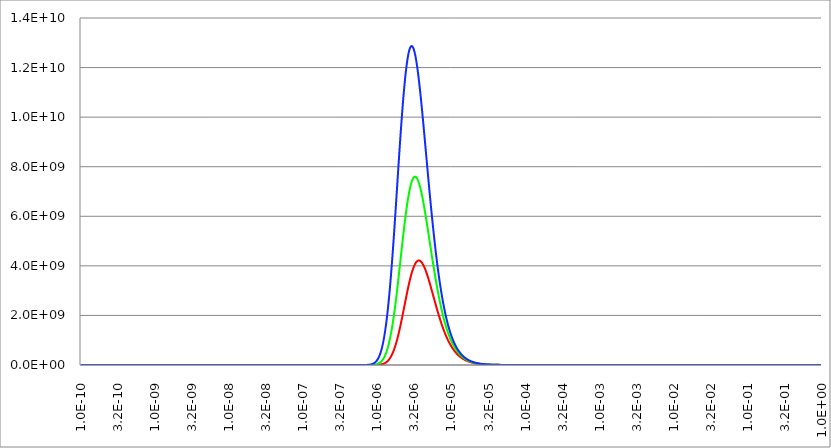
| Category | Series 1 | Series 0 | Series 2 |
|---|---|---|---|
| 1e-10 | 0 | 0 | 0 |
| 1.0115794542599e-10 | 0 | 0 | 0 |
| 1.02329299228075e-10 | 0 | 0 | 0 |
| 1.03514216667934e-10 | 0 | 0 | 0 |
| 1.0471285480509e-10 | 0 | 0 | 0 |
| 1.05925372517729e-10 | 0 | 0 | 0 |
| 1.07151930523761e-10 | 0 | 0 | 0 |
| 1.0839269140212e-10 | 0 | 0 | 0 |
| 1.09647819614319e-10 | 0 | 0 | 0 |
| 1.1091748152624e-10 | 0 | 0 | 0 |
| 1.12201845430196e-10 | 0 | 0 | 0 |
| 1.13501081567232e-10 | 0 | 0 | 0 |
| 1.14815362149688e-10 | 0 | 0 | 0 |
| 1.16144861384034e-10 | 0 | 0 | 0 |
| 1.17489755493953e-10 | 0 | 0 | 0 |
| 1.18850222743702e-10 | 0 | 0 | 0 |
| 1.20226443461741e-10 | 0 | 0 | 0 |
| 1.21618600064637e-10 | 0 | 0 | 0 |
| 1.23026877081238e-10 | 0 | 0 | 0 |
| 1.24451461177139e-10 | 0 | 0 | 0 |
| 1.25892541179417e-10 | 0 | 0 | 0 |
| 1.27350308101666e-10 | 0 | 0 | 0 |
| 1.28824955169314e-10 | 0 | 0 | 0 |
| 1.3031667784523e-10 | 0 | 0 | 0 |
| 1.31825673855641e-10 | 0 | 0 | 0 |
| 1.33352143216333e-10 | 0 | 0 | 0 |
| 1.34896288259166e-10 | 0 | 0 | 0 |
| 1.36458313658893e-10 | 0 | 0 | 0 |
| 1.38038426460289e-10 | 0 | 0 | 0 |
| 1.39636836105594e-10 | 0 | 0 | 0 |
| 1.41253754462276e-10 | 0 | 0 | 0 |
| 1.42889395851111e-10 | 0 | 0 | 0 |
| 1.44543977074593e-10 | 0 | 0 | 0 |
| 1.46217717445672e-10 | 0 | 0 | 0 |
| 1.47910838816821e-10 | 0 | 0 | 0 |
| 1.49623565609444e-10 | 0 | 0 | 0 |
| 1.51356124843621e-10 | 0 | 0 | 0 |
| 1.53108746168203e-10 | 0 | 0 | 0 |
| 1.54881661891248e-10 | 0 | 0 | 0 |
| 1.56675107010815e-10 | 0 | 0 | 0 |
| 1.58489319246112e-10 | 0 | 0 | 0 |
| 1.60324539069005e-10 | 0 | 0 | 0 |
| 1.62181009735893e-10 | 0 | 0 | 0 |
| 1.64058977319954e-10 | 0 | 0 | 0 |
| 1.65958690743756e-10 | 0 | 0 | 0 |
| 1.67880401812256e-10 | 0 | 0 | 0 |
| 1.69824365246175e-10 | 0 | 0 | 0 |
| 1.71790838715759e-10 | 0 | 0 | 0 |
| 1.73780082874938e-10 | 0 | 0 | 0 |
| 1.7579236139587e-10 | 0 | 0 | 0 |
| 1.77827941003893e-10 | 0 | 0 | 0 |
| 1.79887091512879e-10 | 0 | 0 | 0 |
| 1.81970085860999e-10 | 0 | 0 | 0 |
| 1.84077200146896e-10 | 0 | 0 | 0 |
| 1.86208713666287e-10 | 0 | 0 | 0 |
| 1.88364908948981e-10 | 0 | 0 | 0 |
| 1.90546071796325e-10 | 0 | 0 | 0 |
| 1.92752491319094e-10 | 0 | 0 | 0 |
| 1.94984459975805e-10 | 0 | 0 | 0 |
| 1.97242273611486e-10 | 0 | 0 | 0 |
| 1.99526231496889e-10 | 0 | 0 | 0 |
| 2.01836636368157e-10 | 0 | 0 | 0 |
| 2.04173794466954e-10 | 0 | 0 | 0 |
| 2.06538015581054e-10 | 0 | 0 | 0 |
| 2.08929613085405e-10 | 0 | 0 | 0 |
| 2.11348903983666e-10 | 0 | 0 | 0 |
| 2.13796208950224e-10 | 0 | 0 | 0 |
| 2.16271852372703e-10 | 0 | 0 | 0 |
| 2.18776162394956e-10 | 0 | 0 | 0 |
| 2.21309470960565e-10 | 0 | 0 | 0 |
| 2.23872113856835e-10 | 0 | 0 | 0 |
| 2.26464430759307e-10 | 0 | 0 | 0 |
| 2.29086765276778e-10 | 0 | 0 | 0 |
| 2.31739464996849e-10 | 0 | 0 | 0 |
| 2.34422881531993e-10 | 0 | 0 | 0 |
| 2.37137370566167e-10 | 0 | 0 | 0 |
| 2.3988329190195e-10 | 0 | 0 | 0 |
| 2.42661009508243e-10 | 0 | 0 | 0 |
| 2.45470891568504e-10 | 0 | 0 | 0 |
| 2.48313310529558e-10 | 0 | 0 | 0 |
| 2.51188643150959e-10 | 0 | 0 | 0 |
| 2.54097270554932e-10 | 0 | 0 | 0 |
| 2.57039578276888e-10 | 0 | 0 | 0 |
| 2.60015956316529e-10 | 0 | 0 | 0 |
| 2.6302679918954e-10 | 0 | 0 | 0 |
| 2.66072505979882e-10 | 0 | 0 | 0 |
| 2.69153480392693e-10 | 0 | 0 | 0 |
| 2.72270130807793e-10 | 0 | 0 | 0 |
| 2.75422870333818e-10 | 0 | 0 | 0 |
| 2.78612116862979e-10 | 0 | 0 | 0 |
| 2.81838293126447e-10 | 0 | 0 | 0 |
| 2.85101826750393e-10 | 0 | 0 | 0 |
| 2.88403150312662e-10 | 0 | 0 | 0 |
| 2.91742701400118e-10 | 0 | 0 | 0 |
| 2.9512092266664e-10 | 0 | 0 | 0 |
| 2.98538261891798e-10 | 0 | 0 | 0 |
| 3.01995172040203e-10 | 0 | 0 | 0 |
| 3.05492111321553e-10 | 0 | 0 | 0 |
| 3.09029543251361e-10 | 0 | 0 | 0 |
| 3.12607936712397e-10 | 0 | 0 | 0 |
| 3.1622776601684e-10 | 0 | 0 | 0 |
| 3.19889510969142e-10 | 0 | 0 | 0 |
| 3.2359365692963e-10 | 0 | 0 | 0 |
| 3.2734069487884e-10 | 0 | 0 | 0 |
| 3.31131121482593e-10 | 0 | 0 | 0 |
| 3.3496543915783e-10 | 0 | 0 | 0 |
| 3.38844156139205e-10 | 0 | 0 | 0 |
| 3.42767786546453e-10 | 0 | 0 | 0 |
| 3.46736850452534e-10 | 0 | 0 | 0 |
| 3.5075187395257e-10 | 0 | 0 | 0 |
| 3.54813389233578e-10 | 0 | 0 | 0 |
| 3.58921934645008e-10 | 0 | 0 | 0 |
| 3.63078054770104e-10 | 0 | 0 | 0 |
| 3.67282300498087e-10 | 0 | 0 | 0 |
| 3.71535229097175e-10 | 0 | 0 | 0 |
| 3.75837404288447e-10 | 0 | 0 | 0 |
| 3.80189396320564e-10 | 0 | 0 | 0 |
| 3.84591782045356e-10 | 0 | 0 | 0 |
| 3.89045144994284e-10 | 0 | 0 | 0 |
| 3.9355007545578e-10 | 0 | 0 | 0 |
| 3.981071705535e-10 | 0 | 0 | 0 |
| 4.02717034325462e-10 | 0 | 0 | 0 |
| 4.07380277804116e-10 | 0 | 0 | 0 |
| 4.12097519097333e-10 | 0 | 0 | 0 |
| 4.16869383470339e-10 | 0 | 0 | 0 |
| 4.21696503428586e-10 | 0 | 0 | 0 |
| 4.26579518801596e-10 | 0 | 0 | 0 |
| 4.31519076827769e-10 | 0 | 0 | 0 |
| 4.36515832240169e-10 | 0 | 0 | 0 |
| 4.41570447353316e-10 | 0 | 0 | 0 |
| 4.46683592150967e-10 | 0 | 0 | 0 |
| 4.51855944374926e-10 | 0 | 0 | 0 |
| 4.57088189614879e-10 | 0 | 0 | 0 |
| 4.62381021399264e-10 | 0 | 0 | 0 |
| 4.67735141287202e-10 | 0 | 0 | 0 |
| 4.73151258961485e-10 | 0 | 0 | 0 |
| 4.78630092322642e-10 | 0 | 0 | 0 |
| 4.84172367584104e-10 | 0 | 0 | 0 |
| 4.89778819368451e-10 | 0 | 0 | 0 |
| 4.95450190804795e-10 | 0 | 0 | 0 |
| 5.01187233627277e-10 | 0 | 0 | 0 |
| 5.06990708274709e-10 | 0 | 0 | 0 |
| 5.12861383991369e-10 | 0 | 0 | 0 |
| 5.18800038928966e-10 | 0 | 0 | 0 |
| 5.24807460249777e-10 | 0 | 0 | 0 |
| 5.30884444230993e-10 | 0 | 0 | 0 |
| 5.37031796370258e-10 | 0 | 0 | 0 |
| 5.43250331492438e-10 | 0 | 0 | 0 |
| 5.4954087385763e-10 | 0 | 0 | 0 |
| 5.55904257270409e-10 | 0 | 0 | 0 |
| 5.62341325190354e-10 | 0 | 0 | 0 |
| 5.68852930843847e-10 | 0 | 0 | 0 |
| 5.75439937337162e-10 | 0 | 0 | 0 |
| 5.82103217770877e-10 | 0 | 0 | 0 |
| 5.88843655355595e-10 | 0 | 0 | 0 |
| 5.95662143529016e-10 | 0 | 0 | 0 |
| 6.02559586074364e-10 | 0 | 0 | 0 |
| 6.09536897240175e-10 | 0 | 0 | 0 |
| 6.16595001861488e-10 | 0 | 0 | 0 |
| 6.23734835482425e-10 | 0 | 0 | 0 |
| 6.309573444802e-10 | 0 | 0 | 0 |
| 6.38263486190555e-10 | 0 | 0 | 0 |
| 6.45654229034662e-10 | 0 | 0 | 0 |
| 6.53130552647479e-10 | 0 | 0 | 0 |
| 6.60693448007603e-10 | 0 | 0 | 0 |
| 6.68343917568622e-10 | 0 | 0 | 0 |
| 6.76082975391989e-10 | 0 | 0 | 0 |
| 6.83911647281436e-10 | 0 | 0 | 0 |
| 6.91830970918944e-10 | 0 | 0 | 0 |
| 6.99841996002281e-10 | 0 | 0 | 0 |
| 7.07945784384146e-10 | 0 | 0 | 0 |
| 7.1614341021291e-10 | 0 | 0 | 0 |
| 7.24435960074998e-10 | 0 | 0 | 0 |
| 7.32824533138912e-10 | 0 | 0 | 0 |
| 7.41310241300926e-10 | 0 | 0 | 0 |
| 7.49894209332464e-10 | 0 | 0 | 0 |
| 7.58577575029192e-10 | 0 | 0 | 0 |
| 7.67361489361827e-10 | 0 | 0 | 0 |
| 7.762471166287e-10 | 0 | 0 | 0 |
| 7.85235634610081e-10 | 0 | 0 | 0 |
| 7.9432823472429e-10 | 0 | 0 | 0 |
| 8.03526122185626e-10 | 0 | 0 | 0 |
| 8.12830516164109e-10 | 0 | 0 | 0 |
| 8.2224264994708e-10 | 0 | 0 | 0 |
| 8.31763771102681e-10 | 0 | 0 | 0 |
| 8.41395141645205e-10 | 0 | 0 | 0 |
| 8.51138038202386e-10 | 0 | 0 | 0 |
| 8.60993752184611e-10 | 0 | 0 | 0 |
| 8.70963589956091e-10 | 0 | 0 | 0 |
| 8.81048873008025e-10 | 0 | 0 | 0 |
| 8.91250938133756e-10 | 0 | 0 | 0 |
| 9.01571137605968e-10 | 0 | 0 | 0 |
| 9.12010839355921e-10 | 0 | 0 | 0 |
| 9.22571427154774e-10 | 0 | 0 | 0 |
| 9.33254300797002e-10 | 0 | 0 | 0 |
| 9.44060876285935e-10 | 0 | 0 | 0 |
| 9.54992586021448e-10 | 0 | 0 | 0 |
| 9.66050878989825e-10 | 0 | 0 | 0 |
| 9.77237220955822e-10 | 0 | 0 | 0 |
| 9.88553094656951e-10 | 0 | 0 | 0 |
| 1.00000000000001e-09 | 0 | 0 | 0 |
| 1.01157945425991e-09 | 0 | 0 | 0 |
| 1.02329299228077e-09 | 0 | 0 | 0 |
| 1.03514216667936e-09 | 0 | 0 | 0 |
| 1.04712854805091e-09 | 0 | 0 | 0 |
| 1.0592537251773e-09 | 0 | 0 | 0 |
| 1.07151930523762e-09 | 0 | 0 | 0 |
| 1.08392691402122e-09 | 0 | 0 | 0 |
| 1.0964781961432e-09 | 0 | 0 | 0 |
| 1.10917481526242e-09 | 0 | 0 | 0 |
| 1.12201845430198e-09 | 0 | 0 | 0 |
| 1.13501081567233e-09 | 0 | 0 | 0 |
| 1.1481536214969e-09 | 0 | 0 | 0 |
| 1.16144861384036e-09 | 0 | 0 | 0 |
| 1.17489755493954e-09 | 0 | 0 | 0 |
| 1.18850222743703e-09 | 0 | 0 | 0 |
| 1.20226443461743e-09 | 0 | 0 | 0 |
| 1.21618600064638e-09 | 0 | 0 | 0 |
| 1.2302687708124e-09 | 0 | 0 | 0 |
| 1.2445146117714e-09 | 0 | 0 | 0 |
| 1.25892541179418e-09 | 0 | 0 | 0 |
| 1.27350308101668e-09 | 0 | 0 | 0 |
| 1.28824955169315e-09 | 0 | 0 | 0 |
| 1.30316677845232e-09 | 0 | 0 | 0 |
| 1.31825673855643e-09 | 0 | 0 | 0 |
| 1.33352143216334e-09 | 0 | 0 | 0 |
| 1.34896288259167e-09 | 0 | 0 | 0 |
| 1.36458313658894e-09 | 0 | 0 | 0 |
| 1.3803842646029e-09 | 0 | 0 | 0 |
| 1.39636836105596e-09 | 0 | 0 | 0 |
| 1.41253754462277e-09 | 0 | 0 | 0 |
| 1.42889395851112e-09 | 0 | 0 | 0 |
| 1.44543977074595e-09 | 0 | 0 | 0 |
| 1.46217717445674e-09 | 0 | 0 | 0 |
| 1.47910838816823e-09 | 0 | 0 | 0 |
| 1.49623565609445e-09 | 0 | 0 | 0 |
| 1.51356124843623e-09 | 0 | 0 | 0 |
| 1.53108746168205e-09 | 0 | 0 | 0 |
| 1.5488166189125e-09 | 0 | 0 | 0 |
| 1.56675107010817e-09 | 0 | 0 | 0 |
| 1.58489319246114e-09 | 0 | 0 | 0 |
| 1.60324539069007e-09 | 0 | 0 | 0 |
| 1.62181009735895e-09 | 0 | 0 | 0 |
| 1.64058977319956e-09 | 0 | 0 | 0 |
| 1.65958690743759e-09 | 0 | 0 | 0 |
| 1.67880401812259e-09 | 0 | 0 | 0 |
| 1.69824365246177e-09 | 0 | 0 | 0 |
| 1.71790838715761e-09 | 0 | 0 | 0 |
| 1.7378008287494e-09 | 0 | 0 | 0 |
| 1.75792361395872e-09 | 0 | 0 | 0 |
| 1.77827941003895e-09 | 0 | 0 | 0 |
| 1.79887091512882e-09 | 0 | 0 | 0 |
| 1.81970085861001e-09 | 0 | 0 | 0 |
| 1.84077200146898e-09 | 0 | 0 | 0 |
| 1.8620871366629e-09 | 0 | 0 | 0 |
| 1.88364908948983e-09 | 0 | 0 | 0 |
| 1.90546071796328e-09 | 0 | 0 | 0 |
| 1.92752491319097e-09 | 0 | 0 | 0 |
| 1.94984459975808e-09 | 0 | 0 | 0 |
| 1.97242273611489e-09 | 0 | 0 | 0 |
| 1.99526231496891e-09 | 0 | 0 | 0 |
| 2.01836636368159e-09 | 0 | 0 | 0 |
| 2.04173794466956e-09 | 0 | 0 | 0 |
| 2.06538015581056e-09 | 0 | 0 | 0 |
| 2.08929613085407e-09 | 0 | 0 | 0 |
| 2.11348903983668e-09 | 0 | 0 | 0 |
| 2.13796208950227e-09 | 0 | 0 | 0 |
| 2.16271852372706e-09 | 0 | 0 | 0 |
| 2.18776162394959e-09 | 0 | 0 | 0 |
| 2.21309470960568e-09 | 0 | 0 | 0 |
| 2.23872113856838e-09 | 0 | 0 | 0 |
| 2.2646443075931e-09 | 0 | 0 | 0 |
| 2.29086765276781e-09 | 0 | 0 | 0 |
| 2.31739464996852e-09 | 0 | 0 | 0 |
| 2.34422881531996e-09 | 0 | 0 | 0 |
| 2.3713737056617e-09 | 0 | 0 | 0 |
| 2.39883291901953e-09 | 0 | 0 | 0 |
| 2.42661009508246e-09 | 0 | 0 | 0 |
| 2.45470891568507e-09 | 0 | 0 | 0 |
| 2.48313310529561e-09 | 0 | 0 | 0 |
| 2.51188643150962e-09 | 0 | 0 | 0 |
| 2.54097270554935e-09 | 0 | 0 | 0 |
| 2.57039578276891e-09 | 0 | 0 | 0 |
| 2.60015956316532e-09 | 0 | 0 | 0 |
| 2.63026799189543e-09 | 0 | 0 | 0 |
| 2.66072505979886e-09 | 0 | 0 | 0 |
| 2.69153480392696e-09 | 0 | 0 | 0 |
| 2.72270130807796e-09 | 0 | 0 | 0 |
| 2.75422870333822e-09 | 0 | 0 | 0 |
| 2.78612116862982e-09 | 0 | 0 | 0 |
| 2.81838293126451e-09 | 0 | 0 | 0 |
| 2.85101826750396e-09 | 0 | 0 | 0 |
| 2.88403150312666e-09 | 0 | 0 | 0 |
| 2.91742701400122e-09 | 0 | 0 | 0 |
| 2.95120922666644e-09 | 0 | 0 | 0 |
| 2.98538261891802e-09 | 0 | 0 | 0 |
| 3.01995172040207e-09 | 0 | 0 | 0 |
| 3.05492111321557e-09 | 0 | 0 | 0 |
| 3.09029543251365e-09 | 0 | 0 | 0 |
| 3.12607936712402e-09 | 0 | 0 | 0 |
| 3.16227766016844e-09 | 0 | 0 | 0 |
| 3.19889510969146e-09 | 0 | 0 | 0 |
| 3.23593656929635e-09 | 0 | 0 | 0 |
| 3.27340694878845e-09 | 0 | 0 | 0 |
| 3.31131121482598e-09 | 0 | 0 | 0 |
| 3.34965439157834e-09 | 0 | 0 | 0 |
| 3.38844156139209e-09 | 0 | 0 | 0 |
| 3.42767786546457e-09 | 0 | 0 | 0 |
| 3.46736850452539e-09 | 0 | 0 | 0 |
| 3.50751873952575e-09 | 0 | 0 | 0 |
| 3.54813389233583e-09 | 0 | 0 | 0 |
| 3.58921934645013e-09 | 0 | 0 | 0 |
| 3.63078054770109e-09 | 0 | 0 | 0 |
| 3.67282300498092e-09 | 0 | 0 | 0 |
| 3.7153522909718e-09 | 0 | 0 | 0 |
| 3.75837404288452e-09 | 0 | 0 | 0 |
| 3.80189396320569e-09 | 0 | 0 | 0 |
| 3.84591782045362e-09 | 0 | 0 | 0 |
| 3.89045144994289e-09 | 0 | 0 | 0 |
| 3.93550075455786e-09 | 0 | 0 | 0 |
| 3.98107170553506e-09 | 0 | 0 | 0 |
| 4.02717034325468e-09 | 0 | 0 | 0 |
| 4.07380277804121e-09 | 0 | 0 | 0 |
| 4.12097519097339e-09 | 0 | 0 | 0 |
| 4.16869383470344e-09 | 0 | 0 | 0 |
| 4.21696503428591e-09 | 0 | 0 | 0 |
| 4.26579518801602e-09 | 0 | 0 | 0 |
| 4.31519076827775e-09 | 0 | 0 | 0 |
| 4.36515832240176e-09 | 0 | 0 | 0 |
| 4.41570447353322e-09 | 0 | 0 | 0 |
| 4.46683592150973e-09 | 0 | 0 | 0 |
| 4.51855944374932e-09 | 0 | 0 | 0 |
| 4.57088189614885e-09 | 0 | 0 | 0 |
| 4.62381021399271e-09 | 0 | 0 | 0 |
| 4.67735141287209e-09 | 0 | 0 | 0 |
| 4.73151258961491e-09 | 0 | 0 | 0 |
| 4.78630092322649e-09 | 0 | 0 | 0 |
| 4.8417236758411e-09 | 0 | 0 | 0 |
| 4.89778819368457e-09 | 0 | 0 | 0 |
| 4.95450190804802e-09 | 0 | 0 | 0 |
| 5.01187233627284e-09 | 0 | 0 | 0 |
| 5.06990708274716e-09 | 0 | 0 | 0 |
| 5.12861383991377e-09 | 0 | 0 | 0 |
| 5.18800038928973e-09 | 0 | 0 | 0 |
| 5.24807460249785e-09 | 0 | 0 | 0 |
| 5.30884444231001e-09 | 0 | 0 | 0 |
| 5.37031796370265e-09 | 0 | 0 | 0 |
| 5.43250331492446e-09 | 0 | 0 | 0 |
| 5.49540873857637e-09 | 0 | 0 | 0 |
| 5.55904257270416e-09 | 0 | 0 | 0 |
| 5.62341325190362e-09 | 0 | 0 | 0 |
| 5.68852930843855e-09 | 0 | 0 | 0 |
| 5.7543993733717e-09 | 0 | 0 | 0 |
| 5.82103217770885e-09 | 0 | 0 | 0 |
| 5.88843655355603e-09 | 0 | 0 | 0 |
| 5.95662143529024e-09 | 0 | 0 | 0 |
| 6.02559586074372e-09 | 0 | 0 | 0 |
| 6.09536897240183e-09 | 0 | 0 | 0 |
| 6.16595001861497e-09 | 0 | 0 | 0 |
| 6.23734835482434e-09 | 0 | 0 | 0 |
| 6.30957344480208e-09 | 0 | 0 | 0 |
| 6.38263486190564e-09 | 0 | 0 | 0 |
| 6.45654229034671e-09 | 0 | 0 | 0 |
| 6.53130552647488e-09 | 0 | 0 | 0 |
| 6.60693448007612e-09 | 0 | 0 | 0 |
| 6.68343917568631e-09 | 0 | 0 | 0 |
| 6.76082975391998e-09 | 0 | 0 | 0 |
| 6.83911647281446e-09 | 0 | 0 | 0 |
| 6.91830970918953e-09 | 0 | 0 | 0 |
| 6.9984199600229e-09 | 0 | 0 | 0 |
| 7.07945784384155e-09 | 0 | 0 | 0 |
| 7.16143410212919e-09 | 0 | 0 | 0 |
| 7.24435960075008e-09 | 0 | 0 | 0 |
| 7.32824533138922e-09 | 0 | 0 | 0 |
| 7.41310241300936e-09 | 0 | 0 | 0 |
| 7.49894209332474e-09 | 0 | 0 | 0 |
| 7.58577575029203e-09 | 0 | 0 | 0 |
| 7.67361489361838e-09 | 0 | 0 | 0 |
| 7.76247116628711e-09 | 0 | 0 | 0 |
| 7.85235634610091e-09 | 0 | 0 | 0 |
| 7.94328234724301e-09 | 0 | 0 | 0 |
| 8.03526122185637e-09 | 0 | 0 | 0 |
| 8.1283051616412e-09 | 0 | 0 | 0 |
| 8.22242649947092e-09 | 0 | 0 | 0 |
| 8.31763771102692e-09 | 0 | 0 | 0 |
| 8.41395141645216e-09 | 0 | 0 | 0 |
| 8.51138038202398e-09 | 0 | 0 | 0 |
| 8.60993752184623e-09 | 0 | 0 | 0 |
| 8.70963589956103e-09 | 0 | 0 | 0 |
| 8.81048873008037e-09 | 0 | 0 | 0 |
| 8.91250938133769e-09 | 0 | 0 | 0 |
| 9.01571137605981e-09 | 0 | 0 | 0 |
| 9.12010839355934e-09 | 0 | 0 | 0 |
| 9.22571427154787e-09 | 0 | 0 | 0 |
| 9.33254300797016e-09 | 0 | 0 | 0 |
| 9.44060876285948e-09 | 0 | 0 | 0 |
| 9.54992586021461e-09 | 0 | 0 | 0 |
| 9.6605087898984e-09 | 0 | 0 | 0 |
| 9.77237220955837e-09 | 0 | 0 | 0 |
| 9.88553094656965e-09 | 0 | 0 | 0 |
| 1.00000000000003e-08 | 0 | 0 | 0 |
| 1.01157945425993e-08 | 0 | 0 | 0 |
| 1.02329299228078e-08 | 0 | 0 | 0 |
| 1.03514216667937e-08 | 0 | 0 | 0 |
| 1.04712854805093e-08 | 0 | 0 | 0 |
| 1.05925372517732e-08 | 0 | 0 | 0 |
| 1.07151930523764e-08 | 0 | 0 | 0 |
| 1.08392691402123e-08 | 0 | 0 | 0 |
| 1.09647819614322e-08 | 0 | 0 | 0 |
| 1.10917481526243e-08 | 0 | 0 | 0 |
| 1.12201845430199e-08 | 0 | 0 | 0 |
| 1.13501081567235e-08 | 0 | 0 | 0 |
| 1.14815362149691e-08 | 0 | 0 | 0 |
| 1.16144861384038e-08 | 0 | 0 | 0 |
| 1.17489755493956e-08 | 0 | 0 | 0 |
| 1.18850222743705e-08 | 0 | 0 | 0 |
| 1.20226443461745e-08 | 0 | 0 | 0 |
| 1.2161860006464e-08 | 0 | 0 | 0 |
| 1.23026877081242e-08 | 0 | 0 | 0 |
| 1.24451461177142e-08 | 0 | 0 | 0 |
| 1.2589254117942e-08 | 0 | 0 | 0 |
| 1.2735030810167e-08 | 0 | 0 | 0 |
| 1.28824955169317e-08 | 0 | 0 | 0 |
| 1.30316677845234e-08 | 0 | 0 | 0 |
| 1.31825673855644e-08 | 0 | 0 | 0 |
| 1.33352143216336e-08 | 0 | 0 | 0 |
| 1.34896288259169e-08 | 0 | 0 | 0 |
| 1.36458313658896e-08 | 0 | 0 | 0 |
| 1.38038426460292e-08 | 0 | 0 | 0 |
| 1.39636836105598e-08 | 0 | 0 | 0 |
| 1.4125375446228e-08 | 0 | 0 | 0 |
| 1.42889395851114e-08 | 0 | 0 | 0 |
| 1.44543977074597e-08 | 0 | 0 | 0 |
| 1.46217717445676e-08 | 0 | 0 | 0 |
| 1.47910838816825e-08 | 0 | 0 | 0 |
| 1.49623565609448e-08 | 0 | 0 | 0 |
| 1.51356124843625e-08 | 0 | 0 | 0 |
| 1.53108746168208e-08 | 0 | 0 | 0 |
| 1.54881661891253e-08 | 0 | 0 | 0 |
| 1.5667510701082e-08 | 0 | 0 | 0 |
| 1.58489319246116e-08 | 0 | 0 | 0 |
| 1.60324539069009e-08 | 0 | 0 | 0 |
| 1.62181009735898e-08 | 0 | 0 | 0 |
| 1.64058977319959e-08 | 0 | 0 | 0 |
| 1.65958690743761e-08 | 0 | 0 | 0 |
| 1.67880401812261e-08 | 0 | 0 | 0 |
| 1.6982436524618e-08 | 0 | 0 | 0 |
| 1.71790838715764e-08 | 0 | 0 | 0 |
| 1.73780082874943e-08 | 0 | 0 | 0 |
| 1.75792361395875e-08 | 0 | 0 | 0 |
| 1.77827941003898e-08 | 0 | 0 | 0 |
| 1.79887091512884e-08 | 0 | 0 | 0 |
| 1.81970085861004e-08 | 0 | 0 | 0 |
| 1.84077200146901e-08 | 0 | 0 | 0 |
| 1.86208713666292e-08 | 0 | 0 | 0 |
| 1.88364908948986e-08 | 0 | 0 | 0 |
| 1.90546071796331e-08 | 0 | 0 | 0 |
| 1.927524913191e-08 | 0 | 0 | 0 |
| 1.94984459975811e-08 | 0 | 0 | 0 |
| 1.97242273611492e-08 | 0 | 0 | 0 |
| 1.99526231496894e-08 | 0 | 0 | 0 |
| 2.01836636368162e-08 | 0 | 0 | 0 |
| 2.04173794466959e-08 | 0 | 0 | 0 |
| 2.06538015581059e-08 | 0 | 0 | 0 |
| 2.08929613085411e-08 | 0 | 0 | 0 |
| 2.11348903983671e-08 | 0 | 0 | 0 |
| 2.1379620895023e-08 | 0 | 0 | 0 |
| 2.16271852372709e-08 | 0 | 0 | 0 |
| 2.18776162394962e-08 | 0 | 0 | 0 |
| 2.21309470960571e-08 | 0 | 0 | 0 |
| 2.23872113856841e-08 | 0 | 0 | 0 |
| 2.26464430759313e-08 | 0 | 0 | 0 |
| 2.29086765276785e-08 | 0 | 0 | 0 |
| 2.31739464996855e-08 | 0 | 0 | 0 |
| 2.34422881532e-08 | 0 | 0 | 0 |
| 2.37137370566173e-08 | 0 | 0 | 0 |
| 2.39883291901957e-08 | 0 | 0 | 0 |
| 2.42661009508249e-08 | 0 | 0 | 0 |
| 2.45470891568511e-08 | 0 | 0 | 0 |
| 2.48313310529565e-08 | 0 | 0 | 0 |
| 2.51188643150966e-08 | 0 | 0 | 0 |
| 2.54097270554939e-08 | 0 | 0 | 0 |
| 2.57039578276895e-08 | 0 | 0 | 0 |
| 2.60015956316536e-08 | 0 | 0 | 0 |
| 2.63026799189547e-08 | 0 | 0 | 0 |
| 2.6607250597989e-08 | 0 | 0 | 0 |
| 2.691534803927e-08 | 0 | 0 | 0 |
| 2.722701308078e-08 | 0 | 0 | 0 |
| 2.75422870333826e-08 | 0 | 0 | 0 |
| 2.78612116862986e-08 | 0 | 0 | 0 |
| 2.81838293126455e-08 | 0 | 0 | 0 |
| 2.851018267504e-08 | 0 | 0 | 0 |
| 2.8840315031267e-08 | 0 | 0 | 0 |
| 2.91742701400126e-08 | 0 | 0 | 0 |
| 2.95120922666648e-08 | 0 | 0 | 0 |
| 2.98538261891806e-08 | 0 | 0 | 0 |
| 3.01995172040212e-08 | 0 | 0 | 0 |
| 3.05492111321562e-08 | 0 | 0 | 0 |
| 3.0902954325137e-08 | 0 | 0 | 0 |
| 3.12607936712406e-08 | 0 | 0 | 0 |
| 3.16227766016849e-08 | 0 | 0 | 0 |
| 3.19889510969151e-08 | 0 | 0 | 0 |
| 3.23593656929639e-08 | 0 | 0 | 0 |
| 3.27340694878849e-08 | 0 | 0 | 0 |
| 3.31131121482602e-08 | 0 | 0 | 0 |
| 3.34965439157839e-08 | 0 | 0 | 0 |
| 3.38844156139214e-08 | 0 | 0 | 0 |
| 3.42767786546462e-08 | 0 | 0 | 0 |
| 3.46736850452544e-08 | 0 | 0 | 0 |
| 3.5075187395258e-08 | 0 | 0 | 0 |
| 3.54813389233588e-08 | 0 | 0 | 0 |
| 3.58921934645018e-08 | 0 | 0 | 0 |
| 3.63078054770114e-08 | 0 | 0 | 0 |
| 3.67282300498097e-08 | 0 | 0 | 0 |
| 3.71535229097186e-08 | 0 | 0 | 0 |
| 3.75837404288457e-08 | 0 | 0 | 0 |
| 3.80189396320575e-08 | 0 | 0 | 0 |
| 3.84591782045367e-08 | 0 | 0 | 0 |
| 3.89045144994294e-08 | 0 | 0 | 0 |
| 3.93550075455791e-08 | 0 | 0 | 0 |
| 3.98107170553511e-08 | 0 | 0 | 0 |
| 4.02717034325473e-08 | 0 | 0 | 0 |
| 4.07380277804127e-08 | 0 | 0 | 0 |
| 4.12097519097345e-08 | 0 | 0 | 0 |
| 4.1686938347035e-08 | 0 | 0 | 0 |
| 4.21696503428597e-08 | 0 | 0 | 0 |
| 4.26579518801608e-08 | 0 | 0 | 0 |
| 4.31519076827781e-08 | 0 | 0 | 0 |
| 4.36515832240182e-08 | 0 | 0 | 0 |
| 4.41570447353328e-08 | 0 | 0 | 0 |
| 4.46683592150979e-08 | 0 | 0 | 0 |
| 4.51855944374939e-08 | 0 | 0 | 0 |
| 4.57088189614892e-08 | 0 | 0 | 0 |
| 4.62381021399277e-08 | 0 | 0 | 0 |
| 4.67735141287215e-08 | 0 | 0 | 0 |
| 4.73151258961498e-08 | 0 | 0 | 0 |
| 4.78630092322656e-08 | 0 | 0 | 0 |
| 4.84172367584117e-08 | 0 | 0 | 0 |
| 4.89778819368464e-08 | 0 | 0 | 0 |
| 4.95450190804808e-08 | 0 | 0 | 0 |
| 5.01187233627291e-08 | 0 | 0 | 0 |
| 5.06990708274723e-08 | 0 | 0 | 0 |
| 5.12861383991384e-08 | 0 | 0 | 0 |
| 5.1880003892898e-08 | 0 | 0 | 0 |
| 5.24807460249792e-08 | 0 | 0 | 0 |
| 5.30884444231008e-08 | 0 | 0 | 0 |
| 5.37031796370273e-08 | 0 | 0 | 0 |
| 5.43250331492453e-08 | 0 | 0 | 0 |
| 5.49540873857645e-08 | 0 | 0 | 0 |
| 5.55904257270424e-08 | 0 | 0 | 0 |
| 5.6234132519037e-08 | 0 | 0 | 0 |
| 5.68852930843863e-08 | 0 | 0 | 0 |
| 5.75439937337178e-08 | 0 | 0 | 0 |
| 5.82103217770893e-08 | 0 | 0 | 0 |
| 5.88843655355611e-08 | 0 | 0 | 0 |
| 5.95662143529033e-08 | 0 | 0 | 0 |
| 6.0255958607438e-08 | 0 | 0 | 0 |
| 6.09536897240192e-08 | 0 | 0 | 0 |
| 6.16595001861505e-08 | 0 | 0 | 0 |
| 6.23734835482443e-08 | 0 | 0 | 0 |
| 6.30957344480217e-08 | 0 | 0 | 0 |
| 6.38263486190573e-08 | 0 | 0 | 0 |
| 6.4565422903468e-08 | 0 | 0 | 0 |
| 6.53130552647497e-08 | 0 | 0 | 0 |
| 6.60693448007621e-08 | 0 | 0 | 0 |
| 6.6834391756864e-08 | 0 | 0 | 0 |
| 6.76082975392007e-08 | 0 | 0 | 0 |
| 6.83911647281455e-08 | 0 | 0 | 0 |
| 6.91830970918963e-08 | 0 | 0 | 0 |
| 6.998419960023e-08 | 0 | 0 | 0 |
| 7.07945784384165e-08 | 0 | 0 | 0 |
| 7.16143410212929e-08 | 0 | 0 | 0 |
| 7.24435960075018e-08 | 0 | 0 | 0 |
| 7.32824533138932e-08 | 0 | 0 | 0 |
| 7.41310241300946e-08 | 0 | 0 | 0 |
| 7.49894209332485e-08 | 0 | 0 | 0 |
| 7.58577575029213e-08 | 0 | 0 | 0 |
| 7.67361489361849e-08 | 0 | 0 | 0 |
| 7.76247116628722e-08 | 0 | 0 | 0 |
| 7.85235634610102e-08 | 0 | 0 | 0 |
| 7.94328234724312e-08 | 0 | 0 | 0 |
| 8.03526122185649e-08 | 0 | 0 | 0 |
| 8.12830516164131e-08 | 0 | 0 | 0 |
| 8.22242649947103e-08 | 0 | 0 | 0 |
| 8.31763771102704e-08 | 0 | 0 | 0 |
| 8.41395141645228e-08 | 0 | 0 | 0 |
| 8.5113803820241e-08 | 0 | 0 | 0 |
| 8.60993752184634e-08 | 0 | 0 | 0 |
| 8.70963589956115e-08 | 0 | 0 | 0 |
| 8.81048873008049e-08 | 0 | 0 | 0 |
| 8.91250938133781e-08 | 0 | 0 | 0 |
| 9.01571137605992e-08 | 0 | 0 | 0 |
| 9.12010839355946e-08 | 0 | 0 | 0 |
| 9.225714271548e-08 | 0 | 0 | 0 |
| 9.33254300797028e-08 | 0 | 0 | 0 |
| 9.44060876285961e-08 | 0 | 0 | 0 |
| 9.54992586021474e-08 | 0 | 0 | 0 |
| 9.66050878989852e-08 | 0 | 0 | 0 |
| 9.7723722095585e-08 | 0 | 0 | 0 |
| 9.88553094656978e-08 | 0 | 0 | 0 |
| 1.00000000000004e-07 | 0 | 0 | 0 |
| 1.01157945425994e-07 | 0 | 0 | 0 |
| 1.0232929922808e-07 | 0 | 0 | 0 |
| 1.03514216667939e-07 | 0 | 0 | 0 |
| 1.04712854805094e-07 | 0 | 0 | 0 |
| 1.05925372517733e-07 | 0 | 0 | 0 |
| 1.07151930523765e-07 | 0 | 0 | 0 |
| 1.08392691402125e-07 | 0 | 0 | 0 |
| 1.09647819614323e-07 | 0 | 0 | 0 |
| 1.10917481526245e-07 | 0 | 0 | 0 |
| 1.12201845430201e-07 | 0 | 0 | 0 |
| 1.13501081567236e-07 | 0 | 0 | 0 |
| 1.14815362149693e-07 | 0 | 0 | 0 |
| 1.16144861384039e-07 | 0 | 0 | 0 |
| 1.17489755493958e-07 | 0 | 0 | 0 |
| 1.18850222743707e-07 | 0 | 0 | 0 |
| 1.20226443461746e-07 | 0 | 0 | 0 |
| 1.21618600064642e-07 | 0 | 0 | 0 |
| 1.23026877081243e-07 | 0 | 0 | 0 |
| 1.24451461177144e-07 | 0 | 0 | 0 |
| 1.25892541179422e-07 | 0 | 0 | 0 |
| 1.27350308101671e-07 | 0 | 0 | 0 |
| 1.28824955169319e-07 | 0 | 0 | 0 |
| 1.30316677845235e-07 | 0 | 0 | 0 |
| 1.31825673855646e-07 | 0 | 0 | 0 |
| 1.33352143216338e-07 | 0 | 0 | 0 |
| 1.34896288259171e-07 | 0 | 0 | 0 |
| 1.36458313658898e-07 | 0 | 0 | 0 |
| 1.38038426460294e-07 | 0 | 0 | 0 |
| 1.396368361056e-07 | 0 | 0 | 0 |
| 1.41253754462281e-07 | 0 | 0 | 0 |
| 1.42889395851116e-07 | 0 | 0 | 0 |
| 1.44543977074599e-07 | 0 | 0 | 0 |
| 1.46217717445678e-07 | 0 | 0 | 0 |
| 1.47910838816827e-07 | 0 | 0 | 0 |
| 1.4962356560945e-07 | 0 | 0 | 0 |
| 1.51356124843627e-07 | 0 | 0 | 0 |
| 1.53108746168209e-07 | 0 | 0 | 0 |
| 1.54881661891255e-07 | 0 | 0 | 0 |
| 1.56675107010822e-07 | 0 | 0 | 0 |
| 1.58489319246118e-07 | 0 | 0 | 0 |
| 1.60324539069011e-07 | 0 | 0 | 0 |
| 1.621810097359e-07 | 0 | 0 | 0 |
| 1.64058977319961e-07 | 0 | 0 | 0 |
| 1.65958690743763e-07 | 0 | 0 | 0 |
| 1.67880401812263e-07 | 0 | 0 | 0 |
| 1.69824365246182e-07 | 0 | 0 | 0 |
| 1.71790838715766e-07 | 0 | 0 | 0 |
| 1.73780082874945e-07 | 0 | 0 | 0 |
| 1.75792361395877e-07 | 0 | 0 | 0 |
| 1.778279410039e-07 | 0 | 0 | 0 |
| 1.79887091512887e-07 | 0 | 0 | 0 |
| 1.81970085861006e-07 | 0 | 0 | 0 |
| 1.84077200146904e-07 | 0 | 0 | 0 |
| 1.86208713666295e-07 | 0 | 0 | 0 |
| 1.88364908948988e-07 | 0 | 0 | 0 |
| 1.90546071796333e-07 | 0 | 0 | 0 |
| 1.92752491319102e-07 | 0 | 0 | 0 |
| 1.94984459975813e-07 | 0 | 0 | 0 |
| 1.97242273611494e-07 | 0 | 0 | 0 |
| 1.99526231496897e-07 | 0 | 0 | 0 |
| 2.01836636368165e-07 | 0 | 0 | 0 |
| 2.04173794466962e-07 | 0 | 0 | 0 |
| 2.06538015581062e-07 | 0 | 0 | 0 |
| 2.08929613085413e-07 | 0 | 0 | 0 |
| 2.11348903983674e-07 | 0 | 0 | 0 |
| 2.13796208950233e-07 | 0 | 0 | 0 |
| 2.16271852372712e-07 | 0 | 0 | 0 |
| 2.18776162394965e-07 | 0 | 0 | 0 |
| 2.21309470960574e-07 | 0 | 0 | 0 |
| 2.23872113856844e-07 | 0 | 0 | 0 |
| 2.26464430759316e-07 | 0 | 0 | 0 |
| 2.29086765276788e-07 | 0 | 0 | 0 |
| 2.31739464996858e-07 | 0 | 0 | 0 |
| 2.34422881532003e-07 | 0 | 0 | 0 |
| 2.37137370566176e-07 | 0 | 0 | 0 |
| 2.3988329190196e-07 | 0 | 0 | 0 |
| 2.42661009508252e-07 | 0 | 0 | 0 |
| 2.45470891568514e-07 | 0 | 0 | 0 |
| 2.48313310529568e-07 | 0 | 0 | 0 |
| 2.51188643150969e-07 | 0 | 0 | 0 |
| 2.54097270554942e-07 | 0 | 0 | 0 |
| 2.57039578276898e-07 | 0 | 0 | 0 |
| 2.60015956316539e-07 | 0 | 0 | 0 |
| 2.6302679918955e-07 | 0 | 0 | 0 |
| 2.66072505979893e-07 | 0 | 0 | 0 |
| 2.69153480392704e-07 | 0 | 0 | 0 |
| 2.72270130807804e-07 | 0 | 0 | 0 |
| 2.75422870333829e-07 | 0 | 0 | 0 |
| 2.7861211686299e-07 | 0 | 0 | 0 |
| 2.81838293126458e-07 | 0 | 0 | 0 |
| 2.85101826750404e-07 | 0 | 0 | 0 |
| 2.88403150312674e-07 | 0 | 0 | 0 |
| 2.9174270140013e-07 | 0 | 0 | 0 |
| 2.95120922666652e-07 | 0 | 0 | 0 |
| 2.9853826189181e-07 | 0 | 0 | 0 |
| 3.01995172040216e-07 | 0 | 0 | 0 |
| 3.05492111321565e-07 | 0 | 0 | 0 |
| 3.09029543251373e-07 | 0 | 0 | 0.001 |
| 3.1260793671241e-07 | 0 | 0 | 0.001 |
| 3.16227766016853e-07 | 0 | 0 | 0.002 |
| 3.19889510969155e-07 | 0 | 0 | 0.003 |
| 3.23593656929643e-07 | 0 | 0 | 0.005 |
| 3.27340694878853e-07 | 0 | 0 | 0.008 |
| 3.31131121482606e-07 | 0 | 0 | 0.013 |
| 3.34965439157843e-07 | 0 | 0 | 0.02 |
| 3.38844156139218e-07 | 0 | 0 | 0.03 |
| 3.42767786546466e-07 | 0 | 0 | 0.047 |
| 3.46736850452548e-07 | 0 | 0.001 | 0.071 |
| 3.50751873952584e-07 | 0 | 0.001 | 0.108 |
| 3.54813389233592e-07 | 0 | 0.002 | 0.163 |
| 3.58921934645022e-07 | 0 | 0.003 | 0.245 |
| 3.63078054770118e-07 | 0 | 0.004 | 0.366 |
| 3.67282300498102e-07 | 0 | 0.007 | 0.544 |
| 3.7153522909719e-07 | 0 | 0.011 | 0.803 |
| 3.75837404288462e-07 | 0 | 0.017 | 1.182 |
| 3.80189396320579e-07 | 0 | 0.026 | 1.729 |
| 3.84591782045372e-07 | 0 | 0.039 | 2.517 |
| 3.89045144994299e-07 | 0 | 0.06 | 3.647 |
| 3.93550075455796e-07 | 0.001 | 0.09 | 5.257 |
| 3.98107170553516e-07 | 0.001 | 0.136 | 7.542 |
| 4.02717034325478e-07 | 0.001 | 0.203 | 10.768 |
| 4.07380277804132e-07 | 0.002 | 0.302 | 15.302 |
| 4.1209751909735e-07 | 0.004 | 0.447 | 21.644 |
| 4.16869383470355e-07 | 0.005 | 0.658 | 30.472 |
| 4.21696503428603e-07 | 0.008 | 0.964 | 42.705 |
| 4.26579518801613e-07 | 0.013 | 1.405 | 59.58 |
| 4.31519076827786e-07 | 0.02 | 2.036 | 82.751 |
| 4.36515832240187e-07 | 0.03 | 2.938 | 114.426 |
| 4.41570447353334e-07 | 0.046 | 4.218 | 157.537 |
| 4.46683592150985e-07 | 0.069 | 6.026 | 215.956 |
| 4.51855944374944e-07 | 0.103 | 8.57 | 294.776 |
| 4.57088189614897e-07 | 0.153 | 12.13 | 400.67 |
| 4.62381021399283e-07 | 0.227 | 17.09 | 542.337 |
| 4.67735141287221e-07 | 0.334 | 23.967 | 731.072 |
| 4.73151258961503e-07 | 0.49 | 33.46 | 981.479 |
| 4.78630092322662e-07 | 0.715 | 46.504 | 1312.354 |
| 4.84172367584123e-07 | 1.038 | 64.348 | 1747.796 |
| 4.8977881936847e-07 | 1.499 | 88.65 | 2318.567 |
| 4.95450190804814e-07 | 2.154 | 121.603 | 3063.781 |
| 5.01187233627297e-07 | 3.081 | 166.093 | 4032.96 |
| 5.06990708274729e-07 | 4.387 | 225.903 | 5288.563 |
| 5.1286138399139e-07 | 6.216 | 305.969 | 6909.042 |
| 5.18800038928987e-07 | 8.767 | 412.705 | 8992.554 |
| 5.24807460249798e-07 | 12.308 | 554.404 | 11661.43 |
| 5.30884444231014e-07 | 17.2 | 741.755 | 15067.541 |
| 5.37031796370279e-07 | 23.93 | 988.465 | 19398.71 |
| 5.4325033149246e-07 | 33.146 | 1312.043 | 24886.343 |
| 5.49540873857652e-07 | 45.71 | 1734.767 | 31814.472 |
| 5.55904257270431e-07 | 62.764 | 2284.859 | 40530.43 |
| 5.62341325190377e-07 | 85.811 | 2997.936 | 51457.398 |
| 5.6885293084387e-07 | 116.824 | 3918.761 | 65109.085 |
| 5.75439937337185e-07 | 158.382 | 5103.374 | 82106.849 |
| 5.821032177709e-07 | 213.835 | 6621.659 | 103199.566 |
| 5.88843655355618e-07 | 287.523 | 8560.425 | 129286.603 |
| 5.9566214352904e-07 | 385.043 | 11027.092 | 161444.269 |
| 6.02559586074388e-07 | 513.579 | 14154.083 | 200956.148 |
| 6.095368972402e-07 | 682.319 | 18104.028 | 249347.737 |
| 6.16595001861513e-07 | 902.961 | 23075.915 | 308425.849 |
| 6.23734835482451e-07 | 1190.342 | 29312.317 | 380323.242 |
| 6.30957344480225e-07 | 1563.2 | 37107.865 | 467548.964 |
| 6.38263486190581e-07 | 2045.109 | 46819.122 | 573044.92 |
| 6.45654229034688e-07 | 2665.609 | 58876.06 | 700249.158 |
| 6.53130552647505e-07 | 3461.568 | 73795.333 | 853166.391 |
| 6.60693448007629e-07 | 4478.826 | 92195.571 | 1036446.241 |
| 6.68343917568648e-07 | 5774.155 | 114814.924 | 1255469.705 |
| 6.76082975392016e-07 | 7417.606 | 142531.12 | 1516444.283 |
| 6.83911647281464e-07 | 9495.279 | 176384.285 | 1826508.21 |
| 6.91830970918972e-07 | 12112.614 | 217602.806 | 2193844.149 |
| 6.99841996002309e-07 | 15398.259 | 267632.538 | 2627802.675 |
| 7.07945784384174e-07 | 19508.596 | 328169.621 | 3139035.795 |
| 7.16143410212939e-07 | 24633.04 | 401197.238 | 3739640.648 |
| 7.24435960075027e-07 | 31000.191 | 489026.586 | 4443313.47 |
| 7.32824533138942e-07 | 38884.956 | 594342.367 | 5265513.752 |
| 7.41310241300956e-07 | 48616.772 | 720253.099 | 6223638.419 |
| 7.49894209332495e-07 | 60589.036 | 870346.491 | 7337205.715 |
| 7.58577575029223e-07 | 75269.908 | 1048750.162 | 8628048.315 |
| 7.67361489361859e-07 | 93214.6 | 1260197.917 | 10120515.024 |
| 7.76247116628732e-07 | 115079.333 | 1510101.78 | 11841680.259 |
| 7.85235634610112e-07 | 141637.095 | 1804629.925 | 13821560.299 |
| 7.94328234724323e-07 | 173795.384 | 2150790.618 | 16093335.111 |
| 8.03526122185659e-07 | 212616.079 | 2556522.217 | 18693574.361 |
| 8.12830516164141e-07 | 259337.627 | 3030789.192 | 21662465.996 |
| 8.22242649947114e-07 | 315399.696 | 3583684.093 | 25044045.605 |
| 8.31763771102714e-07 | 382470.459 | 4226535.281 | 28886424.539 |
| 8.41395141645239e-07 | 462476.666 | 4972020.152 | 33242014.581 |
| 8.51138038202421e-07 | 557636.644 | 5834283.501 | 38167746.778 |
| 8.60993752184646e-07 | 670496.351 | 6829060.557 | 43725281.839 |
| 8.70963589956126e-07 | 803968.607 | 7973804.111 | 49981209.376 |
| 8.8104887300806e-07 | 961375.58 | 9287815.058 | 57007233.079 |
| 8.91250938133792e-07 | 1146494.593 | 10792375.534 | 64880338.83 |
| 9.01571137606004e-07 | 1363607.295 | 12510883.73 | 73682942.637 |
| 9.12010839355958e-07 | 1617552.176 | 14468989.327 | 83503015.2 |
| 9.22571427154812e-07 | 1913780.402 | 16694728.394 | 94434179.901 |
| 9.3325430079704e-07 | 2258414.865 | 19218656.449 | 106575780.986 |
| 9.44060876285973e-07 | 2658312.335 | 22073978.295 | 120032918.748 |
| 9.54992586021486e-07 | 3121128.503 | 25296673.115 | 134916448.588 |
| 9.66050878989865e-07 | 3655385.685 | 28925613.225 | 151342940.948 |
| 9.77237220955863e-07 | 4270542.877 | 33002674.791 | 169434599.26 |
| 9.88553094656991e-07 | 4977067.801 | 37572838.743 | 189319133.253 |
| 1.00000000000005e-06 | 5786510.493 | 42684280.051 | 211129585.181 |
| 1.01157945425995e-06 | 6711577.95 | 48388443.492 | 235004106.856 |
| 1.02329299228081e-06 | 7766209.267 | 54740104.016 | 261085685.634 |
| 1.0351421666794e-06 | 8965650.621 | 61797409.792 | 289521817.909 |
| 1.04712854805096e-06 | 10326529.414 | 69621906.055 | 320464129.041 |
| 1.05925372517735e-06 | 11866926.807 | 78278537.901 | 354067939.064 |
| 1.07151930523766e-06 | 13606447.822 | 87835630.236 | 390491774.013 |
| 1.08392691402126e-06 | 15566288.136 | 98364843.192 | 429896823.145 |
| 1.09647819614324e-06 | 17769296.631 | 109941101.395 | 472446342.869 |
| 1.10917481526246e-06 | 20240032.742 | 122642495.662 | 518305008.712 |
| 1.12201845430202e-06 | 23004817.575 | 136550155.809 | 567638217.155 |
| 1.13501081567238e-06 | 26091777.774 | 151748093.479 | 620611339.753 |
| 1.14815362149694e-06 | 29530881.086 | 168323014.089 | 677388932.43 |
| 1.16144861384041e-06 | 33353962.555 | 186364097.215 | 738133903.419 |
| 1.17489755493959e-06 | 37594740.305 | 205962745.024 | 803006643.788 |
| 1.18850222743708e-06 | 42288819.872 | 227212298.564 | 872164125.011 |
| 1.20226443461748e-06 | 47473686.084 | 250207722.088 | 945758968.49 |
| 1.21618600064643e-06 | 53188681.543 | 275045255.798 | 1023938492.386 |
| 1.23026877081245e-06 | 59474970.79 | 301822037.773 | 1106843741.484 |
| 1.24451461177145e-06 | 66375489.346 | 330635696.121 | 1194608506.214 |
| 1.25892541179424e-06 | 73934876.889 | 361583912.697 | 1287358337.194 |
| 1.27350308101673e-06 | 82199393.911 | 394763960.096 | 1385209561.979 |
| 1.2882495516932e-06 | 91216821.354 | 430272213.881 | 1488268310.841 |
| 1.30316677845237e-06 | 101036342.804 | 468203642.358 | 1596629558.575 |
| 1.31825673855648e-06 | 111708408.982 | 508651276.461 | 1710376189.391 |
| 1.3335214321634e-06 | 123284584.424 | 551705662.635 | 1829578091.952 |
| 1.34896288259173e-06 | 135817376.37 | 597454301.811 | 1954291291.596 |
| 1.364583136589e-06 | 149360046.078 | 645981077.843 | 2084557126.617 |
| 1.38038426460296e-06 | 163966402.912 | 697365678.982 | 2220401475.345 |
| 1.39636836105601e-06 | 179690581.765 | 751683016.127 | 2361834040.483 |
| 1.41253754462283e-06 | 196586804.516 | 809002641.765 | 2508847696.867 |
| 1.42889395851118e-06 | 214709126.42 | 869388173.637 | 2661417908.45 |
| 1.44543977074601e-06 | 234111168.489 | 932896727.232 | 2819502219.883 |
| 1.4621771744568e-06 | 254845837.105 | 999578361.281 | 2983039827.601 |
| 1.47910838816829e-06 | 276965032.254 | 1069475540.42 | 3151951234.784 |
| 1.49623565609452e-06 | 300519345.94 | 1142622619.188 | 3326137994.029 |
| 1.51356124843629e-06 | 325557752.472 | 1219045351.429 | 3505482540.932 |
| 1.53108746168212e-06 | 352127292.467 | 1298760429.095 | 3689848121.19 |
| 1.54881661891257e-06 | 380272752.52 | 1381775054.294 | 3879078813.136 |
| 1.56675107010824e-06 | 410036342.59 | 1468086548.251 | 4072999646.979 |
| 1.5848931924612e-06 | 441457373.276 | 1557682000.637 | 4271416821.311 |
| 1.60324539069013e-06 | 474571935.186 | 1650537962.488 | 4474118016.764 |
| 1.62181009735902e-06 | 509412582.674 | 1746620185.648 | 4680872806.003 |
| 1.64058977319963e-06 | 546008024.262 | 1845883411.371 | 4891433158.562 |
| 1.65958690743765e-06 | 584382822.058 | 1948271210.393 | 5105534038.345 |
| 1.67880401812265e-06 | 624557102.475 | 2053715876.424 | 5322894090.987 |
| 1.69824365246184e-06 | 666546280.54 | 2162138374.653 | 5543216417.613 |
| 1.71790838715768e-06 | 710360800.005 | 2273448346.46 | 5766189430.975 |
| 1.73780082874947e-06 | 756005891.43 | 2387544171.146 | 5991487789.352 |
| 1.75792361395879e-06 | 803481350.288 | 2504313085.063 | 6218773403.097 |
| 1.77827941003902e-06 | 852781337.039 | 2623631358.166 | 6447696508.253 |
| 1.79887091512889e-06 | 903894200.995 | 2745364527.531 | 6677896801.193 |
| 1.81970085861009e-06 | 956802329.645 | 2869367687.048 | 6909004627.923 |
| 1.84077200146906e-06 | 1011482024.933 | 2995485832.045 | 7140642221.294 |
| 1.86208713666297e-06 | 1067903407.824 | 3123554257.249 | 7372424979.171 |
| 1.88364908948991e-06 | 1126030352.279 | 3253399006.107 | 7603962776.352 |
| 1.90546071796335e-06 | 1185820449.575 | 3384837369.114 | 7834861302.885 |
| 1.92752491319105e-06 | 1247225003.688 | 3517678428.506 | 8064723421.354 |
| 1.94984459975816e-06 | 1310189058.216 | 3651723646.326 | 8293150535.644 |
| 1.97242273611497e-06 | 1374651455.152 | 3786767492.599 | 8519743963.728 |
| 1.99526231496899e-06 | 1440544925.512 | 3922598110.111 | 8744106307.077 |
| 2.01836636368168e-06 | 1507796211.675 | 4058998012.038 | 8965842809.445 |
| 2.04173794466965e-06 | 1576326221.007 | 4195744808.481 | 9184562697.912 |
| 2.06538015581065e-06 | 1646050210.144 | 4332611957.824 | 9399880499.35 |
| 2.08929613085416e-06 | 1716877999.105 | 4469369538.66 | 9611417325.688 |
| 2.11348903983677e-06 | 1788714214.167 | 4605785037.98 | 9818802121.699 |
| 2.13796208950235e-06 | 1861458558.26 | 4741624151.218 | 10021672869.362 |
| 2.16271852372714e-06 | 1935006107.445 | 4876651589.755 | 10219677743.234 |
| 2.18776162394968e-06 | 2009247631.847 | 5010631891.454 | 10412476211.689 |
| 2.21309470960577e-06 | 2084069939.299 | 5143330229.868 | 10599740079.289 |
| 2.23872113856847e-06 | 2159356239.731 | 5274513217.803 | 10781154466.044 |
| 2.26464430759319e-06 | 2234986528.302 | 5403949701.052 | 10956418719.756 |
| 2.29086765276791e-06 | 2310837985.074 | 5531411538.201 | 11125247258.164 |
| 2.31739464996861e-06 | 2386785388.992 | 5656674362.601 | 11287370338.057 |
| 2.34422881532006e-06 | 2462701543.83 | 5779518322.761 | 11442534749.079 |
| 2.37137370566179e-06 | 2538457713.713 | 5899728797.609 | 11590504430.38 |
| 2.39883291901963e-06 | 2613924065.787 | 6017097083.312 | 11731061008.836 |
| 2.42661009508256e-06 | 2688970117.591 | 6131421048.58 | 11864004257.972 |
| 2.45470891568517e-06 | 2763465186.671 | 6242505755.605 | 11989152477.284 |
| 2.48313310529571e-06 | 2837278840.019 | 6350164044.1 | 12106342792.033 |
| 2.51188643150973e-06 | 2910281340.924 | 6454217076.156 | 12215431374.102 |
| 2.54097270554945e-06 | 2982344090.901 | 6554494839.901 | 12316293584.898 |
| 2.57039578276901e-06 | 3053340064.398 | 6650836610.295 | 12408824041.686 |
| 2.60015956316542e-06 | 3123144234.118 | 6743091365.618 | 12492936609.146 |
| 2.63026799189554e-06 | 3191633984.811 | 6831118158.559 | 12568564318.273 |
| 2.66072505979897e-06 | 3258689513.584 | 6914786441.086 | 12635659215.093 |
| 2.69153480392707e-06 | 3324194214.828 | 6993976342.546 | 12694192141.946 |
| 2.72270130807807e-06 | 3388035048.043 | 7068578900.777 | 12744152454.375 |
| 2.75422870333833e-06 | 3450102886.939 | 7138496246.227 | 12785547676.888 |
| 2.78612116862993e-06 | 3510292848.38 | 7203641739.409 | 12818403101.082 |
| 2.81838293126462e-06 | 3568504599.849 | 7263940062.198 | 12842761329.783 |
| 2.85101826750408e-06 | 3624642644.309 | 7319327263.793 | 12858681771.014 |
| 2.88403150312678e-06 | 3678616581.465 | 7369750762.348 | 12866240085.736 |
| 2.91742701400134e-06 | 3730341344.618 | 7415169303.49 | 12865527593.35 |
| 2.95120922666656e-06 | 3779737412.442 | 7455552877.165 | 12856650639.074 |
| 2.98538261891814e-06 | 3826730995.211 | 7490882594.413 | 12839729927.291 |
| 3.0199517204022e-06 | 3871254195.121 | 7521150525.829 | 12814899824.987 |
| 3.0549211132157e-06 | 3913245140.562 | 7546359503.634 | 12782307639.396 |
| 3.09029543251378e-06 | 3952648094.286 | 7566522889.394 | 12742112873.894 |
| 3.12607936712414e-06 | 3989413535.636 | 7581664309.521 | 12694486466.164 |
| 3.16227766016857e-06 | 4023498217.078 | 7591817360.812 | 12639610012.512 |
| 3.19889510969159e-06 | 4054865195.461 | 7597025288.323 | 12577674982.179 |
| 3.23593656929648e-06 | 4083483838.535 | 7597340637.957 | 12508881925.302 |
| 3.27340694878858e-06 | 4109329807.379 | 7592824886.152 | 12433439678.104 |
| 3.31131121482611e-06 | 4132385015.516 | 7583548049.125 | 12351564568.698 |
| 3.34965439157848e-06 | 4152637565.568 | 7569588274.073 | 12263479626.75 |
| 3.38844156139223e-06 | 4170081664.426 | 7551031414.784 | 12169413800.071 |
| 3.42767786546471e-06 | 4184717517.971 | 7527970594.048 | 12069601181.017 |
| 3.46736850452553e-06 | 4196551206.463 | 7500505755.226 | 11964280245.416 |
| 3.50751873952589e-06 | 4205594541.774 | 7468743205.322 | 11853693106.501 |
| 3.54813389233597e-06 | 4211864907.709 | 7432795151.782 | 11738084786.191 |
| 3.58921934645027e-06 | 4215385084.667 | 7392779235.248 | 11617702505.806 |
| 3.63078054770123e-06 | 4216183059.969 | 7348818060.335 | 11492794998.158 |
| 3.67282300498107e-06 | 4214291825.174 | 7301038726.493 | 11363611842.703 |
| 3.71535229097195e-06 | 4209749161.73 | 7249572360.855 | 11230402825.302 |
| 3.75837404288467e-06 | 4202597416.311 | 7194553654.909 | 11093417323.9 |
| 3.80189396320584e-06 | 4192883267.182 | 7136120406.715 | 10952903721.26 |
| 3.84591782045377e-06 | 4180657482.941 | 7074413070.276 | 10809108845.71 |
| 3.89045144994304e-06 | 4165974674.949 | 7009574313.564 | 10662277440.672 |
| 3.93550075455802e-06 | 4148893044.73 | 6941748586.582 | 10512651663.566 |
| 3.98107170553522e-06 | 4129474127.634 | 6871081700.727 | 10360470614.535 |
| 4.02717034325484e-06 | 4107782533.95 | 6797720420.598 | 10205969895.254 |
| 4.07380277804138e-06 | 4083885688.676 | 6721812069.297 | 10049381197.959 |
| 4.12097519097356e-06 | 4057853571.076 | 6643504148.115 | 9890931924.68 |
| 4.16869383470361e-06 | 4029758455.093 | 6562943971.413 | 9730844836.522 |
| 4.21696503428608e-06 | 3999674651.659 | 6480278317.395 | 9569337732.732 |
| 4.26579518801619e-06 | 3967678253.871 | 6395653095.336 | 9406623159.168 |
| 4.31519076827792e-06 | 3933846885.932 | 6309213029.738 | 9242908145.671 |
| 4.36515832240193e-06 | 3898259456.705 | 6221101361.799 | 9078393971.759 |
| 4.4157044735334e-06 | 3860995918.674 | 6131459568.443 | 8913275959.972 |
| 4.46683592150991e-06 | 3822137033.013 | 6040427099.109 | 8747743296.109 |
| 4.51855944374951e-06 | 3781764141.429 | 5948141130.367 | 8581978875.553 |
| 4.57088189614904e-06 | 3739958945.35 | 5854736338.383 | 8416159174.773 |
| 4.62381021399289e-06 | 3696803293.005 | 5760344689.14 | 8250454147.109 |
| 4.67735141287227e-06 | 3652378974.821 | 5665095246.285 | 8085027141.827 |
| 4.7315125896151e-06 | 3606767527.571 | 5569113996.365 | 7920034845.453 |
| 4.78630092322668e-06 | 3560050047.574 | 5472523691.183 | 7755627244.332 |
| 4.8417236758413e-06 | 3512307013.239 | 5375443706.937 | 7591947607.353 |
| 4.89778819368477e-06 | 3463618117.175 | 5277989919.742 | 7429132487.751 |
| 4.95450190804821e-06 | 3414062108.011 | 5180274597.108 | 7267311742.903 |
| 5.01187233627304e-06 | 3363716642.059 | 5082406304.897 | 7106608571.021 |
| 5.06990708274736e-06 | 3312658144.859 | 4984489829.225 | 6947139563.655 |
| 5.12861383991397e-06 | 3260961682.631 | 4886626112.791 | 6789014772.904 |
| 5.18800038928994e-06 | 3208700843.602 | 4788912205.035 | 6632337792.287 |
| 5.24807460249806e-06 | 3155947629.125 | 4691441225.544 | 6477205850.189 |
| 5.30884444231022e-06 | 3102772354.487 | 4594302340.082 | 6323709914.862 |
| 5.37031796370287e-06 | 3049243559.253 | 4497580748.629 | 6171934809.955 |
| 5.43250331492468e-06 | 2995427926.973 | 4401357684.776 | 6021959339.585 |
| 5.49540873857659e-06 | 2941390214.023 | 4305710425.852 | 5873856421.982 |
| 5.55904257270439e-06 | 2887193187.375 | 4210712313.117 | 5727693230.783 |
| 5.62341325190385e-06 | 2832897570.999 | 4116432781.389 | 5583531343.07 |
| 5.68852930843878e-06 | 2778562000.646 | 4022937397.463 | 5441426893.29 |
| 5.75439937337194e-06 | 2724242986.697 | 3930287906.677 | 5301430732.223 |
| 5.82103217770909e-06 | 2669994884.758 | 3838542287.01 | 5163588590.21 |
| 5.88843655355627e-06 | 2615869873.696 | 3747754810.087 | 5027941243.881 |
| 5.95662143529048e-06 | 2561917940.748 | 3657976108.494 | 4894524685.67 |
| 6.02559586074396e-06 | 2508186873.382 | 3569253248.817 | 4763370295.427 |
| 6.09536897240208e-06 | 2454722257.538 | 3481629809.825 | 4634505013.502 |
| 6.16595001861522e-06 | 2401567481.905 | 3395145965.253 | 4507951514.685 |
| 6.23734835482459e-06 | 2348763747.877 | 3309838570.647 | 4383728382.434 |
| 6.30957344480234e-06 | 2296350084.814 | 3225741253.76 | 4261850282.886 |
| 6.3826348619059e-06 | 2244363370.267 | 3142884507.998 | 4142328138.127 |
| 6.45654229034697e-06 | 2192838354.814 | 3061295788.453 | 4025169298.293 |
| 6.53130552647514e-06 | 2141807691.141 | 2980999610.07 | 3910377712.077 |
| 6.60693448007639e-06 | 2091301967.049 | 2902017647.519 | 3797954095.241 |
| 6.68343917568658e-06 | 2041349742.022 | 2824368836.368 | 3687896096.81 |
| 6.76082975392025e-06 | 1991977587.065 | 2748069475.182 | 3580198462.603 |
| 6.83911647281474e-06 | 1943210127.451 | 2673133328.174 | 3474853195.823 |
| 6.91830970918981e-06 | 1895070088.101 | 2599571728.084 | 3371849714.458 |
| 6.99841996002319e-06 | 1847578341.287 | 2527393678.963 | 3271175005.244 |
| 7.07945784384184e-06 | 1800753956.358 | 2456605958.578 | 3172813774.001 |
| 7.16143410212948e-06 | 1754614251.237 | 2387213220.156 | 3076748592.168 |
| 7.24435960075037e-06 | 1709174845.399 | 2319218093.217 | 2982960039.377 |
| 7.32824533138952e-06 | 1664449714.096 | 2252621283.282 | 2891426841.941 |
| 7.41310241300966e-06 | 1620451243.585 | 2187421670.221 | 2802126007.161 |
| 7.49894209332505e-06 | 1577190287.119 | 2123616405.068 | 2715032953.346 |
| 7.58577575029233e-06 | 1534676221.509 | 2061201005.121 | 2630121635.51 |
| 7.67361489361869e-06 | 1492917004.032 | 2000169447.183 | 2547364666.671 |
| 7.76247116628742e-06 | 1451919229.509 | 1940514258.786 | 2466733434.743 |
| 7.85235634610123e-06 | 1411688187.37 | 1882226607.298 | 2388198214.995 |
| 7.94328234724334e-06 | 1372227918.543 | 1825296386.797 | 2311728278.088 |
| 8.0352612218567e-06 | 1333541272.012 | 1769712302.617 | 2237291993.696 |
| 8.12830516164153e-06 | 1295629960.903 | 1715461953.494 | 2164856929.747 |
| 8.22242649947125e-06 | 1258494617.966 | 1662531911.25 | 2094389947.31 |
| 8.31763771102726e-06 | 1222134850.337 | 1610907797.958 | 2025857291.198 |
| 8.4139514164525e-06 | 1186549293.467 | 1560574360.549 | 1959224676.315 |
| 8.51138038202432e-06 | 1151735664.125 | 1511515542.837 | 1894457369.85 |
| 8.60993752184657e-06 | 1117690812.383 | 1463714554.933 | 1831520269.359 |
| 8.70963589956138e-06 | 1084410772.505 | 1417153940.051 | 1770377976.839 |
| 8.81048873008072e-06 | 1051890812.669 | 1371815638.698 | 1710994868.875 |
| 8.91250938133804e-06 | 1020125483.47 | 1327681050.252 | 1653335162.938 |
| 9.01571137606016e-06 | 989108665.133 | 1284731091.959 | 1597362979.963 |
| 9.1201083935597e-06 | 958833613.417 | 1242946255.344 | 1543042403.267 |
| 9.22571427154824e-06 | 929293004.144 | 1202306660.096 | 1490337533.948 |
| 9.33254300797053e-06 | 900478976.348 | 1162792105.437 | 1439212542.843 |
| 9.44060876285986e-06 | 872383174.005 | 1124382119.015 | 1389631719.169 |
| 9.54992586021499e-06 | 844996786.333 | 1087056003.387 | 1341559515.953 |
| 9.66050878989878e-06 | 818310586.646 | 1050792880.108 | 1294960592.36 |
| 9.77237220955876e-06 | 792314969.762 | 1015571731.5 | 1249799853.026 |
| 9.88553094657005e-06 | 766999987.956 | 981371440.144 | 1206042484.518 |
| 1.00000000000007e-05 | 742355385.468 | 948170826.157 | 1163653989.023 |
| 1.01157945425997e-05 | 718370631.566 | 915948682.309 | 1122600215.375 |
| 1.02329299228082e-05 | 695034952.187 | 884683807.046 | 1082847387.546 |
| 1.03514216667941e-05 | 672337360.155 | 854355035.473 | 1044362130.681 |
| 1.04712854805097e-05 | 650266684.008 | 824941268.369 | 1007111494.814 |
| 1.05925372517736e-05 | 628811595.448 | 796421499.298 | 971062976.344 |
| 1.07151930523768e-05 | 607960635.44 | 768774839.873 | 936184537.4 |
| 1.08392691402128e-05 | 587702238.981 | 741980543.249 | 902444623.175 |
| 1.09647819614326e-05 | 568024758.571 | 716018025.902 | 869812177.336 |
| 1.10917481526248e-05 | 548916486.425 | 690866887.767 | 838256655.612 |
| 1.12201845430204e-05 | 530365675.43 | 666506930.797 | 807748037.652 |
| 1.13501081567239e-05 | 512360558.911 | 642918176 | 778256837.235 |
| 1.14815362149696e-05 | 494889369.221 | 620080879.039 | 749754110.942 |
| 1.16144861384042e-05 | 477940355.19 | 597975544.43 | 722211465.355 |
| 1.17489755493961e-05 | 461501798.477 | 576582938.426 | 695601062.885 |
| 1.1885022274371e-05 | 445562028.853 | 555884100.636 | 669895626.295 |
| 1.20226443461749e-05 | 430109438.457 | 535860354.433 | 645068442.011 |
| 1.21618600064645e-05 | 415132495.052 | 516493316.231 | 621093362.292 |
| 1.23026877081247e-05 | 400619754.33 | 497764903.66 | 597944806.32 |
| 1.24451461177147e-05 | 386559871.294 | 479657342.723 | 575597760.305 |
| 1.25892541179425e-05 | 372941610.751 | 462153173.968 | 554027776.648 |
| 1.27350308101675e-05 | 359753856.965 | 445235257.745 | 533210972.245 |
| 1.28824955169322e-05 | 346985622.489 | 428886778.58 | 513124025.98 |
| 1.30316677845239e-05 | 334626056.223 | 413091248.741 | 493744175.483 |
| 1.3182567385565e-05 | 322664450.728 | 397832511.023 | 475049213.191 |
| 1.33352143216342e-05 | 311090248.83 | 383094740.806 | 457017481.785 |
| 1.34896288259175e-05 | 299893049.554 | 368862447.433 | 439627869.036 |
| 1.36458313658902e-05 | 289062613.406 | 355120474.954 | 422859802.131 |
| 1.38038426460298e-05 | 278588867.054 | 341854002.27 | 406693241.508 |
| 1.39636836105603e-05 | 268461907.424 | 329048542.719 | 391108674.248 |
| 1.41253754462285e-05 | 258672005.25 | 316689943.153 | 376087107.081 |
| 1.4288939585112e-05 | 249209608.102 | 304764382.524 | 361610059.023 |
| 1.44543977074603e-05 | 240065342.931 | 293258370.036 | 347659553.704 |
| 1.46217717445682e-05 | 231230018.142 | 282158742.877 | 334218111.405 |
| 1.47910838816831e-05 | 222694625.238 | 271452663.58 | 321268740.854 |
| 1.49623565609454e-05 | 214450340.056 | 261127617.031 | 308794930.801 |
| 1.51356124843631e-05 | 206488523.616 | 251171407.162 | 296780641.407 |
| 1.53108746168214e-05 | 198800722.609 | 241572153.352 | 285210295.474 |
| 1.54881661891259e-05 | 191378669.555 | 232318286.566 | 274068769.55 |
| 1.56675107010826e-05 | 184214282.643 | 223398545.254 | 263341384.92 |
| 1.58489319246122e-05 | 177299665.281 | 214801971.04 | 253013898.517 |
| 1.60324539069015e-05 | 170627105.369 | 206517904.213 | 243072493.777 |
| 1.62181009735904e-05 | 164189074.336 | 198535979.053 | 233503771.444 |
| 1.64058977319965e-05 | 157978225.925 | 190846119.005 | 224294740.363 |
| 1.65958690743768e-05 | 151987394.777 | 183438531.722 | 215432808.264 |
| 1.67880401812268e-05 | 146209594.818 | 176303704 | 206905772.559 |
| 1.69824365246186e-05 | 140638017.456 | 169432396.608 | 198701811.17 |
| 1.71790838715771e-05 | 135266029.626 | 162815639.048 | 190809473.394 |
| 1.7378008287495e-05 | 130087171.676 | 156444724.243 | 183217670.828 |
| 1.75792361395882e-05 | 125095155.124 | 150311203.181 | 175915668.356 |
| 1.77827941003905e-05 | 120283860.287 | 144406879.511 | 168893075.218 |
| 1.79887091512891e-05 | 115647333.806 | 138723804.125 | 162139836.161 |
| 1.81970085861011e-05 | 111179786.073 | 133254269.718 | 155646222.692 |
| 1.84077200146909e-05 | 106875588.567 | 127990805.346 | 149402824.432 |
| 1.862087136663e-05 | 102729271.126 | 122926170.992 | 143400540.582 |
| 1.88364908948993e-05 | 98735519.144 | 118053352.144 | 137630571.512 |
| 1.90546071796338e-05 | 94889170.715 | 113365554.4 | 132084410.466 |
| 1.92752491319107e-05 | 91185213.736 | 108856198.101 | 126753835.403 |
| 1.94984459975818e-05 | 87618782.966 | 104518913.003 | 121630900.975 |
| 1.97242273611499e-05 | 84185157.057 | 100347532.999 | 116707930.632 |
| 1.99526231496902e-05 | 80879755.566 | 96336090.883 | 111977508.883 |
| 2.01836636368171e-05 | 77698135.943 | 92478813.174 | 107432473.686 |
| 2.04173794466968e-05 | 74635990.52 | 88770115.006 | 103065909.003 |
| 2.06538015581068e-05 | 71689143.488 | 85204595.075 | 98871137.485 |
| 2.08929613085419e-05 | 68853547.879 | 81777030.66 | 94841713.323 |
| 2.1134890398368e-05 | 66125282.56 | 78482372.721 | 90971415.241 |
| 2.13796208950239e-05 | 63500549.229 | 75315741.06 | 87254239.647 |
| 2.16271852372718e-05 | 60975669.437 | 72272419.577 | 83684393.933 |
| 2.18776162394971e-05 | 58547081.626 | 69347851.597 | 80256289.932 |
| 2.2130947096058e-05 | 56211338.191 | 66537635.284 | 76964537.523 |
| 2.2387211385685e-05 | 53965102.57 | 63837519.134 | 73803938.393 |
| 2.26464430759322e-05 | 51805146.365 | 61243397.57 | 70769479.948 |
| 2.29086765276794e-05 | 49728346.494 | 58751306.604 | 67856329.377 |
| 2.31739464996865e-05 | 47731682.385 | 56357419.605 | 65059827.862 |
| 2.34422881532009e-05 | 45812233.197 | 54058043.149 | 62375484.939 |
| 2.37137370566183e-05 | 43967175.096 | 51849612.956 | 59798973.009 |
| 2.39883291901966e-05 | 42193778.557 | 49728689.927 | 57326121.987 |
| 2.42661009508259e-05 | 40489405.721 | 47691956.26 | 54952914.1 |
| 2.45470891568521e-05 | 38851507.79 | 45736211.666 | 52675478.823 |
| 2.48313310529575e-05 | 37277622.477 | 43858369.666 | 50490087.962 |
| 2.51188643150976e-05 | 35765371.488 | 42055453.989 | 48393150.863 |
| 2.54097270554949e-05 | 34312458.068 | 40324595.044 | 46381209.764 |
| 2.57039578276905e-05 | 32916664.585 | 38663026.5 | 44450935.281 |
| 2.60015956316546e-05 | 31575850.166 | 37068081.931 | 42599122.017 |
| 2.63026799189557e-05 | 30287948.387 | 35537191.568 | 40822684.309 |
| 2.660725059799e-05 | 29050965.003 | 34067879.128 | 39118652.091 |
| 2.69153480392711e-05 | 27862975.738 | 32657758.723 | 37484166.889 |
| 2.72270130807811e-05 | 26722124.122 | 31304531.865 | 35916477.931 |
| 2.75422870333837e-05 | 25626619.373 | 30005984.542 | 34412938.376 |
| 2.78612116862997e-05 | 24574734.336 | 28759984.383 | 32971001.66 |
| 2.81838293126466e-05 | 23564803.47 | 27564477.901 | 31588217.957 |
| 2.85101826750412e-05 | 22595220.881 | 26417487.81 | 30262230.743 |
| 2.88403150312682e-05 | 21664438.409 | 25317110.428 | 28990773.479 |
| 2.91742701400138e-05 | 20770963.761 | 24261513.148 | 27771666.386 |
| 2.9512092266666e-05 | 19913358.692 | 23248931.991 | 26602813.336 |
| 2.98538261891818e-05 | 19090237.235 | 22277669.221 | 25482198.833 |
| 3.01995172040224e-05 | 18300263.978 | 21346091.046 | 24407885.1 |
| 3.05492111321574e-05 | 17542152.391 | 20452625.375 | 23378009.25 |
| 3.09029543251382e-05 | 16814663.188 | 19595759.653 | 22390780.563 |
| 3.12607936712419e-05 | 16116602.751 | 18774038.759 | 21444477.841 |
| 3.16227766016861e-05 | 15446821.582 | 17986062.972 | 20537446.861 |
| 3.19889510969163e-05 | 14804212.811 | 17230485.997 | 19668097.904 |
| 3.23593656929652e-05 | 14187710.741 | 16506013.053 | 18834903.376 |
| 3.27340694878863e-05 | 13596289.436 | 15811399.031 | 18036395.501 |
| 3.31131121482616e-05 | 13028961.352 | 15145446.701 | 17271164.099 |
| 3.34965439157853e-05 | 12484776.008 | 14507004.979 | 16537854.435 |
| 3.38844156139228e-05 | 11962818.698 | 13894967.254 | 15835165.148 |
| 3.42767786546476e-05 | 11462209.239 | 13308269.771 | 15161846.244 |
| 3.46736850452557e-05 | 10982100.76 | 12745890.058 | 14516697.164 |
| 3.50751873952594e-05 | 10521678.526 | 12206845.416 | 13898564.921 |
| 3.54813389233602e-05 | 10080158.804 | 11690191.453 | 13306342.293 |
| 3.58921934645032e-05 | 9656787.757 | 11195020.671 | 12738966.092 |
| 3.63078054770129e-05 | 9250840.376 | 10720461.098 | 12195415.484 |
| 3.67282300498112e-05 | 8861619.45 | 10265674.966 | 11674710.376 |
| 3.715352290972e-05 | 8488454.564 | 9829857.438 | 11175909.855 |
| 3.75837404288472e-05 | 8130701.128 | 9412235.375 | 10698110.685 |
| 3.8018939632059e-05 | 7787739.444 | 9012066.148 | 10240445.861 |
| 3.84591782045382e-05 | 7458973.799 | 8628636.488 | 9802083.211 |
| 3.8904514499431e-05 | 7143831.59 | 8261261.381 | 9382224.048 |
| 3.93550075455807e-05 | 6841762.474 | 7909282.997 | 8980101.879 |
| 3.98107170553527e-05 | 6552237.55 | 7572069.658 | 8594981.149 |
| 4.02717034325489e-05 | 6274748.572 | 7249014.847 | 8226156.041 |
| 4.07380277804143e-05 | 6008807.178 | 6939536.243 | 7872949.316 |
| 4.12097519097361e-05 | 5753944.155 | 6643074.799 | 7534711.198 |
| 4.16869383470367e-05 | 5509708.724 | 6359093.85 | 7210818.294 |
| 4.21696503428614e-05 | 5275667.854 | 6087078.249 | 6900672.565 |
| 4.26579518801625e-05 | 5051405.593 | 5826533.542 | 6603700.324 |
| 4.31519076827798e-05 | 4836522.426 | 5576985.169 | 6319351.279 |
| 4.36515832240199e-05 | 4630634.659 | 5337977.69 | 6047097.61 |
| 4.41570447353346e-05 | 4433373.818 | 5109074.046 | 5786433.079 |
| 4.46683592150997e-05 | 4244386.07 | 4889854.844 | 5536872.174 |
| 4.51855944374957e-05 | 4063331.67 | 4679917.667 | 5297949.289 |
| 4.5708818961491e-05 | 3889884.425 | 4478876.414 | 5069217.93 |
| 4.62381021399296e-05 | 3723731.168 | 4286360.657 | 4850249.954 |
| 4.67735141287234e-05 | 3564571.27 | 4102015.031 | 4640634.836 |
| 4.73151258961517e-05 | 3412116.15 | 3925498.636 | 4439978.968 |
| 4.78630092322675e-05 | 3266088.814 | 3756484.475 | 4247904.976 |
| 4.84172367584136e-05 | 3126223.408 | 3594658.898 | 4064051.071 |
| 4.89778819368484e-05 | 2992264.788 | 3439721.079 | 3888070.425 |
| 4.95450190804828e-05 | 2863968.1 | 3291382.506 | 3719630.565 |
| 5.01187233627311e-05 | 2741098.386 | 3149366.493 | 3558412.798 |
| 5.06990708274743e-05 | 2623430.195 | 3013407.71 | 3404111.651 |
| 5.12861383991404e-05 | 2510747.214 | 2883251.728 | 3256434.34 |
| 5.18800038929001e-05 | 2402841.906 | 2758654.589 | 3115100.251 |
| 5.24807460249813e-05 | 2299515.173 | 2639382.382 | 2979840.452 |
| 5.30884444231029e-05 | 2200576.017 | 2525210.845 | 2850397.215 |
| 5.37031796370294e-05 | 2105841.228 | 2415924.976 | 2726523.561 |
| 5.43250331492475e-05 | 2015135.071 | 2311318.661 | 2607982.823 |
| 5.49540873857667e-05 | 1928288.993 | 2211194.316 | 2494548.224 |
| 5.55904257270447e-05 | 1845141.342 | 2115362.544 | 2386002.473 |
| 5.62341325190393e-05 | 1765537.086 | 2023641.805 | 2282137.379 |
| 5.68852930843886e-05 | 1689327.555 | 1935858.098 | 2182753.474 |
| 5.75439937337202e-05 | 1616370.189 | 1851844.652 | 2087659.661 |
| 5.82103217770917e-05 | 1546528.287 | 1771441.641 | 1996672.866 |
| 5.88843655355635e-05 | 1479670.783 | 1694495.892 | 1909617.708 |
| 5.95662143529057e-05 | 1415672.011 | 1620860.623 | 1826326.187 |
| 6.02559586074405e-05 | 1354411.494 | 1550395.178 | 1746637.372 |
| 6.09536897240217e-05 | 1295773.735 | 1482964.779 | 1670397.116 |
| 6.1659500186153e-05 | 1239648.015 | 1418440.283 | 1597457.775 |
| 6.23734835482468e-05 | 1185928.201 | 1356697.955 | 1527677.933 |
| 6.30957344480242e-05 | 1134512.563 | 1297619.247 | 1460922.153 |
| 6.38263486190599e-05 | 1085303.592 | 1241090.581 | 1397060.721 |
| 6.45654229034706e-05 | 1038207.834 | 1187003.148 | 1335969.414 |
| 6.53130552647523e-05 | 993135.721 | 1135252.712 | 1277529.269 |
| 6.60693448007648e-05 | 950001.417 | 1085739.423 | 1221626.364 |
| 6.68343917568667e-05 | 908722.662 | 1038367.63 | 1168151.612 |
| 6.76082975392035e-05 | 869220.632 | 993045.716 | 1117000.553 |
| 6.83911647281483e-05 | 831419.794 | 949685.927 | 1068073.167 |
| 6.91830970918991e-05 | 795247.775 | 908204.211 | 1021273.686 |
| 6.99841996002328e-05 | 760635.23 | 868520.069 | 976510.414 |
| 7.07945784384193e-05 | 727515.719 | 830556.402 | 933695.561 |
| 7.16143410212958e-05 | 695825.589 | 794239.376 | 892745.077 |
| 7.24435960075047e-05 | 665503.86 | 759498.282 | 853578.493 |
| 7.32824533138962e-05 | 636492.112 | 726265.408 | 816118.777 |
| 7.41310241300976e-05 | 608734.383 | 694475.914 | 780292.182 |
| 7.49894209332515e-05 | 582177.066 | 664067.712 | 746028.113 |
| 7.58577575029244e-05 | 556768.811 | 634981.35 | 713258.994 |
| 7.6736148936188e-05 | 532460.436 | 607159.904 | 681920.138 |
| 7.76247116628753e-05 | 509204.832 | 580548.872 | 651949.628 |
| 7.85235634610134e-05 | 486956.879 | 555096.07 | 623288.198 |
| 7.94328234724344e-05 | 465673.367 | 530751.541 | 595879.123 |
| 8.03526122185681e-05 | 445312.912 | 507467.453 | 569668.109 |
| 8.12830516164164e-05 | 425835.882 | 485198.018 | 544603.195 |
| 8.22242649947136e-05 | 407204.324 | 463899.4 | 520634.648 |
| 8.31763771102737e-05 | 389381.895 | 443529.638 | 497714.874 |
| 8.41395141645262e-05 | 372333.795 | 424048.562 | 475798.322 |
| 8.51138038202444e-05 | 356026.701 | 405417.721 | 454841.403 |
| 8.6099375218467e-05 | 340428.705 | 387600.312 | 434802.403 |
| 8.7096358995615e-05 | 325509.258 | 370561.106 | 415641.404 |
| 8.81048873008084e-05 | 311239.111 | 354266.383 | 397320.209 |
| 8.91250938133816e-05 | 297590.26 | 338683.871 | 379802.265 |
| 9.01571137606029e-05 | 284535.895 | 323782.681 | 363052.598 |
| 9.12010839355983e-05 | 272050.348 | 309533.252 | 347037.744 |
| 9.22571427154837e-05 | 260109.05 | 295907.291 | 331725.68 |
| 9.33254300797066e-05 | 248688.478 | 282877.722 | 317085.771 |
| 9.44060876285999e-05 | 237766.116 | 270418.634 | 303088.703 |
| 9.54992586021513e-05 | 227320.41 | 258505.23 | 289706.431 |
| 9.66050878989891e-05 | 217330.73 | 247113.782 | 276912.122 |
| 9.77237220955889e-05 | 207777.328 | 236221.582 | 264680.106 |
| 9.88553094657018e-05 | 198641.301 | 225806.904 | 252985.825 |
| 0.000100000000000008 | 189904.56 | 215848.957 | 241805.783 |
| 0.000101157945425998 | 181549.789 | 206327.846 | 231117.504 |
| 0.000102329299228084 | 173560.417 | 197224.538 | 220899.486 |
| 0.000103514216667943 | 165920.583 | 188520.82 | 211131.162 |
| 0.000104712854805098 | 158615.11 | 180199.266 | 201792.854 |
| 0.000105925372517737 | 151629.471 | 172243.206 | 192865.742 |
| 0.000107151930523769 | 144949.767 | 164636.687 | 184331.822 |
| 0.000108392691402129 | 138562.695 | 157364.45 | 176173.873 |
| 0.000109647819614327 | 132455.526 | 150411.896 | 168375.422 |
| 0.000110917481526249 | 126616.08 | 143765.058 | 160920.714 |
| 0.000112201845430205 | 121032.701 | 137410.574 | 153794.679 |
| 0.000113501081567241 | 115694.238 | 131335.662 | 146982.903 |
| 0.000114815362149698 | 110590.018 | 125528.095 | 140471.6 |
| 0.000116144861384044 | 105709.833 | 119976.175 | 134247.584 |
| 0.000117489755493963 | 101043.914 | 114668.715 | 128298.246 |
| 0.000118850222743712 | 96582.913 | 109595.011 | 122611.523 |
| 0.000120226443461751 | 92317.889 | 104744.826 | 117175.882 |
| 0.000121618600064647 | 88240.286 | 100108.367 | 111980.292 |
| 0.000123026877081248 | 84341.921 | 95676.268 | 107014.202 |
| 0.000124451461177149 | 80614.962 | 91439.569 | 102267.525 |
| 0.000125892541179427 | 77051.919 | 87389.703 | 97730.611 |
| 0.000127350308101677 | 73645.627 | 83518.473 | 93394.235 |
| 0.000128824955169324 | 70389.229 | 79818.04 | 89249.574 |
| 0.000130316677845241 | 67276.168 | 76280.909 | 85288.19 |
| 0.000131825673855651 | 64300.171 | 72899.908 | 81502.016 |
| 0.000133352143216343 | 61455.238 | 69668.181 | 77883.337 |
| 0.000134896288259176 | 58735.63 | 66579.17 | 74424.775 |
| 0.000136458313658904 | 56135.855 | 63626.602 | 71119.276 |
| 0.0001380384264603 | 53650.663 | 60804.481 | 67960.097 |
| 0.000139636836105605 | 51275.032 | 58107.07 | 64940.787 |
| 0.000141253754462287 | 49004.156 | 55528.884 | 62055.179 |
| 0.000142889395851122 | 46833.441 | 53064.678 | 59297.378 |
| 0.000144543977074605 | 44758.492 | 50709.437 | 56661.746 |
| 0.000146217717445684 | 42775.107 | 48458.363 | 54142.892 |
| 0.000147910838816833 | 40879.264 | 46306.87 | 51735.664 |
| 0.000149623565609456 | 39067.119 | 44250.572 | 49435.134 |
| 0.000151356124843633 | 37334.997 | 42285.276 | 47236.59 |
| 0.000153108746168216 | 35679.379 | 40406.971 | 45135.53 |
| 0.000154881661891261 | 34096.904 | 38611.825 | 43127.647 |
| 0.000156675107010828 | 32584.355 | 36896.169 | 41208.824 |
| 0.000158489319246124 | 31138.658 | 35256.499 | 39375.126 |
| 0.000160324539069017 | 29756.87 | 33689.464 | 37622.791 |
| 0.000162181009735906 | 28436.181 | 32191.858 | 35948.22 |
| 0.000164058977319968 | 27173.9 | 30760.619 | 34347.976 |
| 0.00016595869074377 | 25967.456 | 29392.815 | 32818.77 |
| 0.00016788040181227 | 24814.391 | 28085.648 | 31357.461 |
| 0.000169824365246189 | 23712.352 | 26836.438 | 29961.044 |
| 0.000171790838715773 | 22659.091 | 25642.627 | 28626.647 |
| 0.000173780082874952 | 21652.459 | 24501.766 | 27351.526 |
| 0.000175792361395884 | 20690.399 | 23411.516 | 26133.055 |
| 0.000177827941003907 | 19770.947 | 22369.64 | 24968.725 |
| 0.000179887091512894 | 18892.224 | 21373.998 | 23856.14 |
| 0.000181970085861014 | 18052.432 | 20422.548 | 22793.007 |
| 0.000184077200146911 | 17249.853 | 19513.334 | 21777.135 |
| 0.000186208713666302 | 16482.845 | 18644.487 | 20806.428 |
| 0.000188364908948996 | 15749.838 | 17814.223 | 19878.886 |
| 0.000190546071796341 | 15049.331 | 17020.833 | 18992.595 |
| 0.00019275249131911 | 14379.887 | 16262.685 | 18145.726 |
| 0.000194984459975821 | 13740.134 | 15538.219 | 17336.53 |
| 0.000197242273611502 | 13128.761 | 14845.943 | 16563.337 |
| 0.000199526231496905 | 12544.513 | 14184.433 | 15824.549 |
| 0.000201836636368173 | 11986.191 | 13552.324 | 15118.64 |
| 0.00020417379446697 | 11452.649 | 12948.314 | 14444.151 |
| 0.00020653801558107 | 10942.791 | 12371.159 | 13799.686 |
| 0.000208929613085422 | 10455.569 | 11819.667 | 13183.914 |
| 0.000211348903983683 | 9989.982 | 11292.701 | 12595.561 |
| 0.000213796208950241 | 9545.072 | 10789.174 | 12033.407 |
| 0.00021627185237272 | 9119.924 | 10308.047 | 11496.291 |
| 0.000218776162394974 | 8713.663 | 9848.325 | 10983.1 |
| 0.000221309470960583 | 8325.453 | 9409.059 | 10492.771 |
| 0.000223872113856853 | 7954.495 | 8989.342 | 10024.288 |
| 0.000226464430759325 | 7600.024 | 8588.306 | 9576.68 |
| 0.000229086765276797 | 7261.309 | 8205.121 | 9149.02 |
| 0.000231739464996868 | 6937.654 | 7838.997 | 8740.42 |
| 0.000234422881532012 | 6628.389 | 7489.174 | 8350.034 |
| 0.000237137370566186 | 6332.878 | 7154.929 | 7977.05 |
| 0.00023988329190197 | 6050.51 | 6835.571 | 7620.696 |
| 0.000242661009508262 | 5780.703 | 6530.437 | 7280.232 |
| 0.000245470891568524 | 5522.9 | 6238.897 | 6954.951 |
| 0.000248313310529578 | 5276.567 | 5960.345 | 6644.176 |
| 0.000251188643150979 | 5041.197 | 5694.206 | 6347.264 |
| 0.000254097270554952 | 4816.303 | 5439.926 | 6063.597 |
| 0.000257039578276908 | 4601.419 | 5196.98 | 5792.584 |
| 0.000260015956316549 | 4396.101 | 4964.863 | 5533.664 |
| 0.000263026799189561 | 4199.926 | 4743.093 | 5286.297 |
| 0.000266072505979904 | 4012.486 | 4531.21 | 5049.97 |
| 0.000269153480392715 | 3833.393 | 4328.775 | 4824.19 |
| 0.000272270130807815 | 3662.278 | 4135.368 | 4608.488 |
| 0.00027542287033384 | 3498.785 | 3950.586 | 4402.415 |
| 0.000278612116863001 | 3342.576 | 3774.046 | 4205.542 |
| 0.00028183829312647 | 3193.328 | 3605.381 | 4017.458 |
| 0.000285101826750415 | 3050.73 | 3444.24 | 3837.774 |
| 0.000288403150312685 | 2914.488 | 3290.29 | 3666.113 |
| 0.000291742701400142 | 2784.318 | 3143.208 | 3502.119 |
| 0.000295120922666664 | 2659.951 | 3002.691 | 3345.449 |
| 0.000298538261891822 | 2541.129 | 2868.445 | 3195.778 |
| 0.000301995172040228 | 2427.604 | 2740.19 | 3052.793 |
| 0.000305492111321578 | 2319.142 | 2617.662 | 2916.196 |
| 0.000309029543251386 | 2215.517 | 2500.603 | 2785.702 |
| 0.000312607936712423 | 2116.514 | 2388.77 | 2661.04 |
| 0.000316227766016865 | 2021.927 | 2281.931 | 2541.948 |
| 0.000319889510969168 | 1931.56 | 2179.863 | 2428.178 |
| 0.000323593656929656 | 1845.225 | 2082.354 | 2319.494 |
| 0.000327340694878867 | 1762.742 | 1989.199 | 2215.667 |
| 0.00033113112148262 | 1683.94 | 1900.206 | 2116.482 |
| 0.000334965439157857 | 1608.654 | 1815.188 | 2021.731 |
| 0.000338844156139232 | 1536.729 | 1733.969 | 1931.216 |
| 0.00034276778654648 | 1468.015 | 1656.378 | 1844.748 |
| 0.000346736850452562 | 1402.368 | 1582.254 | 1762.147 |
| 0.000350751873952599 | 1339.652 | 1511.443 | 1683.24 |
| 0.000354813389233606 | 1279.737 | 1443.796 | 1607.862 |
| 0.000358921934645037 | 1222.497 | 1379.173 | 1535.855 |
| 0.000363078054770133 | 1167.813 | 1317.438 | 1467.069 |
| 0.000367282300498117 | 1115.571 | 1258.463 | 1401.36 |
| 0.000371535229097205 | 1065.664 | 1202.125 | 1338.59 |
| 0.000375837404288477 | 1017.985 | 1148.305 | 1278.629 |
| 0.000380189396320595 | 972.437 | 1096.891 | 1221.35 |
| 0.000384591782045387 | 928.923 | 1047.777 | 1166.635 |
| 0.000389045144994315 | 887.354 | 1000.859 | 1114.368 |
| 0.000393550075455812 | 847.642 | 956.039 | 1064.44 |
| 0.000398107170553532 | 809.706 | 913.224 | 1016.746 |
| 0.000402717034325494 | 773.464 | 872.324 | 971.187 |
| 0.000407380277804149 | 738.843 | 833.254 | 927.667 |
| 0.000412097519097367 | 705.769 | 795.931 | 886.095 |
| 0.000416869383470372 | 674.174 | 760.278 | 846.385 |
| 0.00042169650342862 | 643.991 | 726.22 | 808.452 |
| 0.00042657951880163 | 615.158 | 693.686 | 772.217 |
| 0.000431519076827803 | 587.614 | 662.608 | 737.605 |
| 0.000436515832240205 | 561.302 | 632.921 | 704.542 |
| 0.000441570447353352 | 536.166 | 604.562 | 672.96 |
| 0.000446683592151003 | 512.155 | 577.473 | 642.792 |
| 0.000451855944374962 | 489.218 | 551.596 | 613.976 |
| 0.000457088189614916 | 467.307 | 526.877 | 586.45 |
| 0.000462381021399301 | 446.375 | 503.265 | 560.157 |
| 0.00046773514128724 | 426.381 | 480.71 | 535.041 |
| 0.000473151258961523 | 407.281 | 459.165 | 511.051 |
| 0.000478630092322681 | 389.035 | 438.585 | 488.135 |
| 0.000484172367584142 | 371.606 | 418.926 | 466.246 |
| 0.00048977881936849 | 354.957 | 400.147 | 445.338 |
| 0.000495450190804834 | 339.053 | 382.209 | 425.366 |
| 0.000501187233627317 | 323.861 | 365.075 | 406.289 |
| 0.00050699070827475 | 309.349 | 348.708 | 388.067 |
| 0.000512861383991411 | 295.486 | 333.074 | 370.662 |
| 0.000518800038929008 | 282.244 | 318.14 | 354.036 |
| 0.00052480746024982 | 269.595 | 303.875 | 338.156 |
| 0.000530884444231036 | 257.512 | 290.249 | 322.987 |
| 0.000537031796370301 | 245.97 | 277.234 | 308.499 |
| 0.000543250331492482 | 234.944 | 264.802 | 294.659 |
| 0.000549540873857674 | 224.413 | 252.926 | 281.44 |
| 0.000555904257270454 | 214.353 | 241.583 | 268.814 |
| 0.0005623413251904 | 204.744 | 230.748 | 256.753 |
| 0.000568852930843893 | 195.565 | 220.399 | 245.234 |
| 0.000575439937337209 | 186.797 | 210.513 | 234.23 |
| 0.000582103217770924 | 178.422 | 201.071 | 223.72 |
| 0.000588843655355642 | 170.422 | 192.052 | 213.682 |
| 0.000595662143529064 | 162.78 | 183.436 | 204.093 |
| 0.000602559586074412 | 155.481 | 175.207 | 194.934 |
| 0.000609536897240224 | 148.508 | 167.347 | 186.186 |
| 0.000616595001861538 | 141.848 | 159.84 | 177.831 |
| 0.000623734835482476 | 135.487 | 152.668 | 169.85 |
| 0.000630957344480251 | 129.411 | 145.819 | 162.227 |
| 0.000638263486190607 | 123.606 | 139.276 | 154.946 |
| 0.000645654229034714 | 118.062 | 133.027 | 147.991 |
| 0.000653130552647532 | 112.767 | 127.058 | 141.349 |
| 0.000660693448007656 | 107.708 | 121.356 | 135.004 |
| 0.000668343917568676 | 102.877 | 115.91 | 128.944 |
| 0.000676082975392043 | 98.262 | 110.709 | 123.156 |
| 0.000683911647281492 | 93.854 | 105.74 | 117.627 |
| 0.000691830970919 | 89.643 | 100.995 | 112.347 |
| 0.000699841996002338 | 85.621 | 96.462 | 107.303 |
| 0.000707945784384203 | 81.78 | 92.133 | 102.486 |
| 0.000716143410212968 | 78.11 | 87.997 | 97.884 |
| 0.000724435960075057 | 74.606 | 84.048 | 93.49 |
| 0.000732824533138971 | 71.258 | 80.275 | 89.292 |
| 0.000741310241300986 | 68.06 | 76.672 | 85.283 |
| 0.000749894209332525 | 65.006 | 73.23 | 81.454 |
| 0.000758577575029254 | 62.089 | 69.943 | 77.796 |
| 0.00076736148936189 | 59.303 | 66.803 | 74.303 |
| 0.000776247116628763 | 56.641 | 63.804 | 70.966 |
| 0.000785235634610144 | 54.099 | 60.939 | 67.78 |
| 0.000794328234724355 | 51.671 | 58.203 | 64.736 |
| 0.000803526122185691 | 49.352 | 55.59 | 61.829 |
| 0.000812830516164174 | 47.137 | 53.094 | 59.052 |
| 0.000822242649947147 | 45.021 | 50.71 | 56.4 |
| 0.000831763771102748 | 43 | 48.434 | 53.867 |
| 0.000841395141645273 | 41.07 | 46.259 | 51.448 |
| 0.000851138038202455 | 39.226 | 44.182 | 49.137 |
| 0.00086099375218468 | 37.465 | 42.198 | 46.93 |
| 0.000870963589956161 | 35.783 | 40.303 | 44.822 |
| 0.000881048873008096 | 34.177 | 38.493 | 42.809 |
| 0.000891250938133828 | 32.643 | 36.764 | 40.886 |
| 0.000901571137606041 | 31.177 | 35.113 | 39.049 |
| 0.000912010839355995 | 29.777 | 33.536 | 37.295 |
| 0.000922571427154849 | 28.44 | 32.03 | 35.62 |
| 0.000933254300797078 | 27.163 | 30.592 | 34.02 |
| 0.000944060876286011 | 25.944 | 29.218 | 32.492 |
| 0.000954992586021525 | 24.779 | 27.905 | 31.032 |
| 0.000966050878989904 | 23.666 | 26.652 | 29.638 |
| 0.000977237220955902 | 22.603 | 25.455 | 28.306 |
| 0.000988553094657031 | 21.588 | 24.311 | 27.035 |
| 0.00100000000000009 | 20.619 | 23.219 | 25.82 |
| 0.00101157945425999 | 19.693 | 22.176 | 24.66 |
| 0.00102329299228085 | 18.808 | 21.18 | 23.552 |
| 0.00103514216667944 | 17.964 | 20.229 | 22.494 |
| 0.001047128548051 | 17.157 | 19.32 | 21.483 |
| 0.00105925372517739 | 16.386 | 18.452 | 20.518 |
| 0.00107151930523771 | 15.65 | 17.623 | 19.596 |
| 0.00108392691402131 | 14.947 | 16.831 | 18.715 |
| 0.00109647819614329 | 14.276 | 16.075 | 17.874 |
| 0.00110917481526251 | 13.635 | 15.353 | 17.071 |
| 0.00112201845430207 | 13.022 | 14.663 | 16.304 |
| 0.00113501081567242 | 12.437 | 14.004 | 15.571 |
| 0.00114815362149699 | 11.879 | 13.375 | 14.872 |
| 0.00116144861384045 | 11.345 | 12.774 | 14.203 |
| 0.00117489755493964 | 10.835 | 12.2 | 13.565 |
| 0.00118850222743713 | 10.349 | 11.652 | 12.955 |
| 0.00120226443461753 | 9.884 | 11.128 | 12.373 |
| 0.00121618600064648 | 9.44 | 10.628 | 11.817 |
| 0.0012302687708125 | 9.016 | 10.151 | 11.286 |
| 0.0012445146117715 | 8.611 | 9.695 | 10.779 |
| 0.00125892541179429 | 8.224 | 9.259 | 10.294 |
| 0.00127350308101678 | 7.854 | 8.843 | 9.832 |
| 0.00128824955169326 | 7.501 | 8.446 | 9.39 |
| 0.00130316677845242 | 7.164 | 8.066 | 8.968 |
| 0.00131825673855653 | 6.842 | 7.704 | 8.565 |
| 0.00133352143216345 | 6.535 | 7.357 | 8.18 |
| 0.00134896288259178 | 6.241 | 7.027 | 7.812 |
| 0.00136458313658905 | 5.961 | 6.711 | 7.461 |
| 0.00138038426460302 | 5.693 | 6.409 | 7.126 |
| 0.00139636836105607 | 5.437 | 6.121 | 6.805 |
| 0.00141253754462289 | 5.193 | 5.846 | 6.499 |
| 0.00142889395851124 | 4.959 | 5.583 | 6.207 |
| 0.00144543977074607 | 4.737 | 5.332 | 5.928 |
| 0.00146217717445686 | 4.524 | 5.093 | 5.662 |
| 0.00147910838816835 | 4.32 | 4.864 | 5.407 |
| 0.00149623565609458 | 4.126 | 4.645 | 5.164 |
| 0.00151356124843635 | 3.941 | 4.436 | 4.932 |
| 0.00153108746168218 | 3.764 | 4.237 | 4.71 |
| 0.00154881661891263 | 3.595 | 4.047 | 4.498 |
| 0.0015667510701083 | 3.433 | 3.865 | 4.296 |
| 0.00158489319246127 | 3.279 | 3.691 | 4.103 |
| 0.0016032453906902 | 3.131 | 3.525 | 3.919 |
| 0.00162181009735909 | 2.991 | 3.367 | 3.742 |
| 0.0016405897731997 | 2.856 | 3.215 | 3.574 |
| 0.00165958690743772 | 2.728 | 3.071 | 3.414 |
| 0.00167880401812272 | 2.605 | 2.933 | 3.26 |
| 0.00169824365246191 | 2.488 | 2.801 | 3.113 |
| 0.00171790838715775 | 2.376 | 2.675 | 2.973 |
| 0.00173780082874954 | 2.269 | 2.555 | 2.84 |
| 0.00175792361395886 | 2.167 | 2.44 | 2.712 |
| 0.00177827941003909 | 2.07 | 2.33 | 2.59 |
| 0.00179887091512896 | 1.977 | 2.225 | 2.474 |
| 0.00181970085861016 | 1.888 | 2.125 | 2.362 |
| 0.00184077200146913 | 1.803 | 2.03 | 2.256 |
| 0.00186208713666305 | 1.722 | 1.938 | 2.155 |
| 0.00188364908948998 | 1.645 | 1.851 | 2.058 |
| 0.00190546071796343 | 1.571 | 1.768 | 1.965 |
| 0.00192752491319112 | 1.5 | 1.689 | 1.877 |
| 0.00194984459975823 | 1.433 | 1.613 | 1.793 |
| 0.00197242273611505 | 1.368 | 1.54 | 1.712 |
| 0.00199526231496907 | 1.307 | 1.471 | 1.635 |
| 0.00201836636368176 | 1.248 | 1.405 | 1.561 |
| 0.00204173794466973 | 1.192 | 1.342 | 1.491 |
| 0.00206538015581073 | 1.138 | 1.281 | 1.424 |
| 0.00208929613085424 | 1.087 | 1.224 | 1.36 |
| 0.00211348903983685 | 1.038 | 1.169 | 1.299 |
| 0.00213796208950244 | 0.992 | 1.116 | 1.241 |
| 0.00216271852372723 | 0.947 | 1.066 | 1.185 |
| 0.00218776162394977 | 0.904 | 1.018 | 1.132 |
| 0.00221309470960585 | 0.864 | 0.972 | 1.081 |
| 0.00223872113856856 | 0.825 | 0.928 | 1.032 |
| 0.00226464430759328 | 0.788 | 0.887 | 0.986 |
| 0.002290867652768 | 0.752 | 0.847 | 0.941 |
| 0.00231739464996871 | 0.719 | 0.809 | 0.899 |
| 0.00234422881532015 | 0.686 | 0.772 | 0.859 |
| 0.00237137370566189 | 0.655 | 0.738 | 0.82 |
| 0.00239883291901973 | 0.626 | 0.704 | 0.783 |
| 0.00242661009508265 | 0.598 | 0.673 | 0.748 |
| 0.00245470891568527 | 0.571 | 0.643 | 0.714 |
| 0.00248313310529582 | 0.545 | 0.614 | 0.682 |
| 0.00251188643150983 | 0.521 | 0.586 | 0.651 |
| 0.00254097270554956 | 0.497 | 0.56 | 0.622 |
| 0.00257039578276912 | 0.475 | 0.535 | 0.594 |
| 0.00260015956316553 | 0.454 | 0.51 | 0.567 |
| 0.00263026799189564 | 0.433 | 0.488 | 0.542 |
| 0.00266072505979907 | 0.414 | 0.466 | 0.517 |
| 0.00269153480392718 | 0.395 | 0.445 | 0.494 |
| 0.00272270130807818 | 0.377 | 0.425 | 0.472 |
| 0.00275422870333844 | 0.36 | 0.406 | 0.451 |
| 0.00278612116863005 | 0.344 | 0.387 | 0.43 |
| 0.00281838293126473 | 0.329 | 0.37 | 0.411 |
| 0.00285101826750419 | 0.314 | 0.353 | 0.393 |
| 0.00288403150312689 | 0.3 | 0.337 | 0.375 |
| 0.00291742701400146 | 0.286 | 0.322 | 0.358 |
| 0.00295120922666668 | 0.273 | 0.308 | 0.342 |
| 0.00298538261891826 | 0.261 | 0.294 | 0.327 |
| 0.00301995172040232 | 0.249 | 0.281 | 0.312 |
| 0.00305492111321582 | 0.238 | 0.268 | 0.298 |
| 0.0030902954325139 | 0.227 | 0.256 | 0.284 |
| 0.00312607936712427 | 0.217 | 0.244 | 0.272 |
| 0.00316227766016869 | 0.207 | 0.233 | 0.259 |
| 0.00319889510969172 | 0.198 | 0.223 | 0.248 |
| 0.00323593656929661 | 0.189 | 0.213 | 0.237 |
| 0.00327340694878871 | 0.181 | 0.203 | 0.226 |
| 0.00331131121482624 | 0.173 | 0.194 | 0.216 |
| 0.00334965439157861 | 0.165 | 0.185 | 0.206 |
| 0.00338844156139236 | 0.157 | 0.177 | 0.197 |
| 0.00342767786546485 | 0.15 | 0.169 | 0.188 |
| 0.00346736850452566 | 0.144 | 0.162 | 0.18 |
| 0.00350751873952603 | 0.137 | 0.154 | 0.171 |
| 0.00354813389233611 | 0.131 | 0.147 | 0.164 |
| 0.00358921934645041 | 0.125 | 0.141 | 0.156 |
| 0.00363078054770138 | 0.119 | 0.134 | 0.149 |
| 0.00367282300498122 | 0.114 | 0.128 | 0.143 |
| 0.0037153522909721 | 0.109 | 0.123 | 0.136 |
| 0.00375837404288482 | 0.104 | 0.117 | 0.13 |
| 0.00380189396320599 | 0.099 | 0.112 | 0.124 |
| 0.00384591782045392 | 0.095 | 0.107 | 0.119 |
| 0.0038904514499432 | 0.091 | 0.102 | 0.113 |
| 0.00393550075455817 | 0.087 | 0.097 | 0.108 |
| 0.00398107170553537 | 0.083 | 0.093 | 0.103 |
| 0.004027170343255 | 0.079 | 0.089 | 0.099 |
| 0.00407380277804154 | 0.075 | 0.085 | 0.094 |
| 0.00412097519097372 | 0.072 | 0.081 | 0.09 |
| 0.00416869383470377 | 0.069 | 0.077 | 0.086 |
| 0.00421696503428625 | 0.066 | 0.074 | 0.082 |
| 0.00426579518801636 | 0.063 | 0.071 | 0.078 |
| 0.00431519076827809 | 0.06 | 0.067 | 0.075 |
| 0.0043651583224021 | 0.057 | 0.064 | 0.072 |
| 0.00441570447353357 | 0.055 | 0.061 | 0.068 |
| 0.00446683592151008 | 0.052 | 0.059 | 0.065 |
| 0.00451855944374968 | 0.05 | 0.056 | 0.062 |
| 0.00457088189614921 | 0.048 | 0.054 | 0.059 |
| 0.00462381021399307 | 0.045 | 0.051 | 0.057 |
| 0.00467735141287246 | 0.043 | 0.049 | 0.054 |
| 0.00473151258961529 | 0.041 | 0.047 | 0.052 |
| 0.00478630092322687 | 0.04 | 0.045 | 0.049 |
| 0.00484172367584149 | 0.038 | 0.043 | 0.047 |
| 0.00489778819368496 | 0.036 | 0.041 | 0.045 |
| 0.00495450190804841 | 0.034 | 0.039 | 0.043 |
| 0.00501187233627323 | 0.033 | 0.037 | 0.041 |
| 0.00506990708274756 | 0.031 | 0.035 | 0.039 |
| 0.00512861383991417 | 0.03 | 0.034 | 0.038 |
| 0.00518800038929014 | 0.029 | 0.032 | 0.036 |
| 0.00524807460249826 | 0.027 | 0.031 | 0.034 |
| 0.00530884444231043 | 0.026 | 0.029 | 0.033 |
| 0.00537031796370308 | 0.025 | 0.028 | 0.031 |
| 0.00543250331492489 | 0.024 | 0.027 | 0.03 |
| 0.00549540873857681 | 0.023 | 0.026 | 0.028 |
| 0.0055590425727046 | 0.022 | 0.024 | 0.027 |
| 0.00562341325190407 | 0.021 | 0.023 | 0.026 |
| 0.005688529308439 | 0.02 | 0.022 | 0.025 |
| 0.00575439937337216 | 0.019 | 0.021 | 0.024 |
| 0.00582103217770931 | 0.018 | 0.02 | 0.023 |
| 0.00588843655355649 | 0.017 | 0.019 | 0.022 |
| 0.00595662143529072 | 0.017 | 0.019 | 0.021 |
| 0.0060255958607442 | 0.016 | 0.018 | 0.02 |
| 0.00609536897240232 | 0.015 | 0.017 | 0.019 |
| 0.00616595001861546 | 0.014 | 0.016 | 0.018 |
| 0.00623734835482483 | 0.014 | 0.015 | 0.017 |
| 0.00630957344480258 | 0.013 | 0.015 | 0.016 |
| 0.00638263486190614 | 0.013 | 0.014 | 0.016 |
| 0.00645654229034722 | 0.012 | 0.013 | 0.015 |
| 0.0065313055264754 | 0.011 | 0.013 | 0.014 |
| 0.00660693448007664 | 0.011 | 0.012 | 0.014 |
| 0.00668343917568684 | 0.01 | 0.012 | 0.013 |
| 0.00676082975392052 | 0.01 | 0.011 | 0.012 |
| 0.006839116472815 | 0.009 | 0.011 | 0.012 |
| 0.00691830970919008 | 0.009 | 0.01 | 0.011 |
| 0.00699841996002346 | 0.009 | 0.01 | 0.011 |
| 0.00707945784384211 | 0.008 | 0.009 | 0.01 |
| 0.00716143410212976 | 0.008 | 0.009 | 0.01 |
| 0.00724435960075065 | 0.008 | 0.008 | 0.009 |
| 0.0073282453313898 | 0.007 | 0.008 | 0.009 |
| 0.00741310241300994 | 0.007 | 0.008 | 0.009 |
| 0.00749894209332534 | 0.007 | 0.007 | 0.008 |
| 0.00758577575029263 | 0.006 | 0.007 | 0.008 |
| 0.00767361489361899 | 0.006 | 0.007 | 0.007 |
| 0.00776247116628772 | 0.006 | 0.006 | 0.007 |
| 0.00785235634610154 | 0.005 | 0.006 | 0.007 |
| 0.00794328234724364 | 0.005 | 0.006 | 0.007 |
| 0.00803526122185701 | 0.005 | 0.006 | 0.006 |
| 0.00812830516164184 | 0.005 | 0.005 | 0.006 |
| 0.00822242649947157 | 0.005 | 0.005 | 0.006 |
| 0.00831763771102758 | 0.004 | 0.005 | 0.005 |
| 0.00841395141645283 | 0.004 | 0.005 | 0.005 |
| 0.00851138038202465 | 0.004 | 0.004 | 0.005 |
| 0.00860993752184691 | 0.004 | 0.004 | 0.005 |
| 0.00870963589956172 | 0.004 | 0.004 | 0.005 |
| 0.00881048873008106 | 0.003 | 0.004 | 0.004 |
| 0.00891250938133839 | 0.003 | 0.004 | 0.004 |
| 0.00901571137606051 | 0.003 | 0.004 | 0.004 |
| 0.00912010839356005 | 0.003 | 0.003 | 0.004 |
| 0.0092257142715486 | 0.003 | 0.003 | 0.004 |
| 0.00933254300797089 | 0.003 | 0.003 | 0.003 |
| 0.00944060876286023 | 0.003 | 0.003 | 0.003 |
| 0.00954992586021536 | 0.002 | 0.003 | 0.003 |
| 0.00966050878989915 | 0.002 | 0.003 | 0.003 |
| 0.00977237220955914 | 0.002 | 0.003 | 0.003 |
| 0.00988553094657043 | 0.002 | 0.002 | 0.003 |
| 0.0100000000000011 | 0.002 | 0.002 | 0.003 |
| 0.0101157945426001 | 0.002 | 0.002 | 0.002 |
| 0.0102329299228086 | 0.002 | 0.002 | 0.002 |
| 0.0103514216667945 | 0.002 | 0.002 | 0.002 |
| 0.0104712854805101 | 0.002 | 0.002 | 0.002 |
| 0.010592537251774 | 0.002 | 0.002 | 0.002 |
| 0.0107151930523772 | 0.002 | 0.002 | 0.002 |
| 0.0108392691402132 | 0.002 | 0.002 | 0.002 |
| 0.010964781961433 | 0.001 | 0.002 | 0.002 |
| 0.0110917481526252 | 0.001 | 0.002 | 0.002 |
| 0.0112201845430208 | 0.001 | 0.001 | 0.002 |
| 0.0113501081567244 | 0.001 | 0.001 | 0.002 |
| 0.01148153621497 | 0.001 | 0.001 | 0.001 |
| 0.0116144861384047 | 0.001 | 0.001 | 0.001 |
| 0.0117489755493965 | 0.001 | 0.001 | 0.001 |
| 0.0118850222743714 | 0.001 | 0.001 | 0.001 |
| 0.0120226443461754 | 0.001 | 0.001 | 0.001 |
| 0.012161860006465 | 0.001 | 0.001 | 0.001 |
| 0.0123026877081251 | 0.001 | 0.001 | 0.001 |
| 0.0124451461177152 | 0.001 | 0.001 | 0.001 |
| 0.012589254117943 | 0.001 | 0.001 | 0.001 |
| 0.012735030810168 | 0.001 | 0.001 | 0.001 |
| 0.0128824955169327 | 0.001 | 0.001 | 0.001 |
| 0.0130316677845244 | 0.001 | 0.001 | 0.001 |
| 0.0131825673855655 | 0.001 | 0.001 | 0.001 |
| 0.0133352143216347 | 0.001 | 0.001 | 0.001 |
| 0.013489628825918 | 0.001 | 0.001 | 0.001 |
| 0.0136458313658907 | 0.001 | 0.001 | 0.001 |
| 0.0138038426460303 | 0.001 | 0.001 | 0.001 |
| 0.0139636836105609 | 0.001 | 0.001 | 0.001 |
| 0.0141253754462291 | 0.001 | 0.001 | 0.001 |
| 0.0142889395851126 | 0 | 0.001 | 0.001 |
| 0.0144543977074608 | 0 | 0.001 | 0.001 |
| 0.0146217717445688 | 0 | 0.001 | 0.001 |
| 0.0147910838816837 | 0 | 0 | 0.001 |
| 0.0149623565609459 | 0 | 0 | 0.001 |
| 0.0151356124843637 | 0 | 0 | 0 |
| 0.015310874616822 | 0 | 0 | 0 |
| 0.0154881661891265 | 0 | 0 | 0 |
| 0.0156675107010832 | 0 | 0 | 0 |
| 0.0158489319246128 | 0 | 0 | 0 |
| 0.0160324539069021 | 0 | 0 | 0 |
| 0.0162181009735911 | 0 | 0 | 0 |
| 0.0164058977319972 | 0 | 0 | 0 |
| 0.0165958690743774 | 0 | 0 | 0 |
| 0.0167880401812274 | 0 | 0 | 0 |
| 0.0169824365246193 | 0 | 0 | 0 |
| 0.0171790838715777 | 0 | 0 | 0 |
| 0.0173780082874956 | 0 | 0 | 0 |
| 0.0175792361395888 | 0 | 0 | 0 |
| 0.0177827941003912 | 0 | 0 | 0 |
| 0.0179887091512898 | 0 | 0 | 0 |
| 0.0181970085861018 | 0 | 0 | 0 |
| 0.0184077200146916 | 0 | 0 | 0 |
| 0.0186208713666307 | 0 | 0 | 0 |
| 0.0188364908949001 | 0 | 0 | 0 |
| 0.0190546071796345 | 0 | 0 | 0 |
| 0.0192752491319115 | 0 | 0 | 0 |
| 0.0194984459975826 | 0 | 0 | 0 |
| 0.0197242273611507 | 0 | 0 | 0 |
| 0.019952623149691 | 0 | 0 | 0 |
| 0.0201836636368178 | 0 | 0 | 0 |
| 0.0204173794466975 | 0 | 0 | 0 |
| 0.0206538015581076 | 0 | 0 | 0 |
| 0.0208929613085427 | 0 | 0 | 0 |
| 0.0211348903983688 | 0 | 0 | 0 |
| 0.0213796208950247 | 0 | 0 | 0 |
| 0.0216271852372726 | 0 | 0 | 0 |
| 0.0218776162394979 | 0 | 0 | 0 |
| 0.0221309470960588 | 0 | 0 | 0 |
| 0.0223872113856859 | 0 | 0 | 0 |
| 0.0226464430759331 | 0 | 0 | 0 |
| 0.0229086765276802 | 0 | 0 | 0 |
| 0.0231739464996873 | 0 | 0 | 0 |
| 0.0234422881532018 | 0 | 0 | 0 |
| 0.0237137370566192 | 0 | 0 | 0 |
| 0.0239883291901975 | 0 | 0 | 0 |
| 0.0242661009508268 | 0 | 0 | 0 |
| 0.024547089156853 | 0 | 0 | 0 |
| 0.0248313310529584 | 0 | 0 | 0 |
| 0.0251188643150986 | 0 | 0 | 0 |
| 0.0254097270554959 | 0 | 0 | 0 |
| 0.0257039578276915 | 0 | 0 | 0 |
| 0.0260015956316556 | 0 | 0 | 0 |
| 0.0263026799189567 | 0 | 0 | 0 |
| 0.026607250597991 | 0 | 0 | 0 |
| 0.0269153480392721 | 0 | 0 | 0 |
| 0.0272270130807821 | 0 | 0 | 0 |
| 0.0275422870333847 | 0 | 0 | 0 |
| 0.0278612116863008 | 0 | 0 | 0 |
| 0.0281838293126477 | 0 | 0 | 0 |
| 0.0285101826750423 | 0 | 0 | 0 |
| 0.0288403150312693 | 0 | 0 | 0 |
| 0.0291742701400149 | 0 | 0 | 0 |
| 0.0295120922666671 | 0 | 0 | 0 |
| 0.0298538261891829 | 0 | 0 | 0 |
| 0.0301995172040235 | 0 | 0 | 0 |
| 0.0305492111321585 | 0 | 0 | 0 |
| 0.0309029543251394 | 0 | 0 | 0 |
| 0.031260793671243 | 0 | 0 | 0 |
| 0.0316227766016873 | 0 | 0 | 0 |
| 0.0319889510969176 | 0 | 0 | 0 |
| 0.0323593656929664 | 0 | 0 | 0 |
| 0.0327340694878875 | 0 | 0 | 0 |
| 0.0331131121482628 | 0 | 0 | 0 |
| 0.0334965439157865 | 0 | 0 | 0 |
| 0.0338844156139241 | 0 | 0 | 0 |
| 0.0342767786546489 | 0 | 0 | 0 |
| 0.0346736850452571 | 0 | 0 | 0 |
| 0.0350751873952607 | 0 | 0 | 0 |
| 0.0354813389233615 | 0 | 0 | 0 |
| 0.0358921934645045 | 0 | 0 | 0 |
| 0.0363078054770142 | 0 | 0 | 0 |
| 0.0367282300498126 | 0 | 0 | 0 |
| 0.0371535229097214 | 0 | 0 | 0 |
| 0.0375837404288486 | 0 | 0 | 0 |
| 0.0380189396320604 | 0 | 0 | 0 |
| 0.0384591782045397 | 0 | 0 | 0 |
| 0.0389045144994324 | 0 | 0 | 0 |
| 0.0393550075455822 | 0 | 0 | 0 |
| 0.0398107170553542 | 0 | 0 | 0 |
| 0.0402717034325505 | 0 | 0 | 0 |
| 0.0407380277804159 | 0 | 0 | 0 |
| 0.0412097519097377 | 0 | 0 | 0 |
| 0.0416869383470383 | 0 | 0 | 0 |
| 0.042169650342863 | 0 | 0 | 0 |
| 0.0426579518801641 | 0 | 0 | 0 |
| 0.0431519076827814 | 0 | 0 | 0 |
| 0.0436515832240215 | 0 | 0 | 0 |
| 0.0441570447353363 | 0 | 0 | 0 |
| 0.0446683592151014 | 0 | 0 | 0 |
| 0.0451855944374974 | 0 | 0 | 0 |
| 0.0457088189614927 | 0 | 0 | 0 |
| 0.0462381021399313 | 0 | 0 | 0 |
| 0.0467735141287251 | 0 | 0 | 0 |
| 0.0473151258961534 | 0 | 0 | 0 |
| 0.0478630092322693 | 0 | 0 | 0 |
| 0.0484172367584154 | 0 | 0 | 0 |
| 0.0489778819368502 | 0 | 0 | 0 |
| 0.0495450190804847 | 0 | 0 | 0 |
| 0.0501187233627329 | 0 | 0 | 0 |
| 0.0506990708274762 | 0 | 0 | 0 |
| 0.0512861383991423 | 0 | 0 | 0 |
| 0.051880003892902 | 0 | 0 | 0 |
| 0.0524807460249833 | 0 | 0 | 0 |
| 0.0530884444231049 | 0 | 0 | 0 |
| 0.0537031796370314 | 0 | 0 | 0 |
| 0.0543250331492495 | 0 | 0 | 0 |
| 0.0549540873857688 | 0 | 0 | 0 |
| 0.0555904257270467 | 0 | 0 | 0 |
| 0.0562341325190414 | 0 | 0 | 0 |
| 0.0568852930843907 | 0 | 0 | 0 |
| 0.0575439937337223 | 0 | 0 | 0 |
| 0.0582103217770938 | 0 | 0 | 0 |
| 0.0588843655355657 | 0 | 0 | 0 |
| 0.0595662143529079 | 0 | 0 | 0 |
| 0.0602559586074427 | 0 | 0 | 0 |
| 0.0609536897240239 | 0 | 0 | 0 |
| 0.0616595001861553 | 0 | 0 | 0 |
| 0.0623734835482491 | 0 | 0 | 0 |
| 0.0630957344480266 | 0 | 0 | 0 |
| 0.0638263486190622 | 0 | 0 | 0 |
| 0.064565422903473 | 0 | 0 | 0 |
| 0.0653130552647548 | 0 | 0 | 0 |
| 0.0660693448007673 | 0 | 0 | 0 |
| 0.0668343917568692 | 0 | 0 | 0 |
| 0.067608297539206 | 0 | 0 | 0 |
| 0.0683911647281509 | 0 | 0 | 0 |
| 0.0691830970919017 | 0 | 0 | 0 |
| 0.0699841996002355 | 0 | 0 | 0 |
| 0.070794578438422 | 0 | 0 | 0 |
| 0.0716143410212986 | 0 | 0 | 0 |
| 0.0724435960075075 | 0 | 0 | 0 |
| 0.073282453313899 | 0 | 0 | 0 |
| 0.0741310241301004 | 0 | 0 | 0 |
| 0.0749894209332544 | 0 | 0 | 0 |
| 0.0758577575029273 | 0 | 0 | 0 |
| 0.0767361489361909 | 0 | 0 | 0 |
| 0.0776247116628783 | 0 | 0 | 0 |
| 0.0785235634610164 | 0 | 0 | 0 |
| 0.0794328234724375 | 0 | 0 | 0 |
| 0.0803526122185711 | 0 | 0 | 0 |
| 0.0812830516164195 | 0 | 0 | 0 |
| 0.0822242649947168 | 0 | 0 | 0 |
| 0.0831763771102769 | 0 | 0 | 0 |
| 0.0841395141645294 | 0 | 0 | 0 |
| 0.0851138038202477 | 0 | 0 | 0 |
| 0.0860993752184702 | 0 | 0 | 0 |
| 0.0870963589956183 | 0 | 0 | 0 |
| 0.0881048873008118 | 0 | 0 | 0 |
| 0.0891250938133851 | 0 | 0 | 0 |
| 0.0901571137606063 | 0 | 0 | 0 |
| 0.0912010839356017 | 0 | 0 | 0 |
| 0.0922571427154872 | 0 | 0 | 0 |
| 0.0933254300797101 | 0 | 0 | 0 |
| 0.0944060876286035 | 0 | 0 | 0 |
| 0.0954992586021549 | 0 | 0 | 0 |
| 0.0966050878989928 | 0 | 0 | 0 |
| 0.0977237220955926 | 0 | 0 | 0 |
| 0.0988553094657056 | 0 | 0 | 0 |
| 0.100000000000012 | 0 | 0 | 0 |
| 0.101157945426002 | 0 | 0 | 0 |
| 0.102329299228088 | 0 | 0 | 0 |
| 0.103514216667947 | 0 | 0 | 0 |
| 0.104712854805102 | 0 | 0 | 0 |
| 0.105925372517741 | 0 | 0 | 0 |
| 0.107151930523773 | 0 | 0 | 0 |
| 0.108392691402133 | 0 | 0 | 0 |
| 0.109647819614332 | 0 | 0 | 0 |
| 0.110917481526253 | 0 | 0 | 0 |
| 0.11220184543021 | 0 | 0 | 0 |
| 0.113501081567245 | 0 | 0 | 0 |
| 0.114815362149702 | 0 | 0 | 0 |
| 0.116144861384048 | 0 | 0 | 0 |
| 0.117489755493967 | 0 | 0 | 0 |
| 0.118850222743716 | 0 | 0 | 0 |
| 0.120226443461756 | 0 | 0 | 0 |
| 0.121618600064651 | 0 | 0 | 0 |
| 0.123026877081253 | 0 | 0 | 0 |
| 0.124451461177153 | 0 | 0 | 0 |
| 0.125892541179432 | 0 | 0 | 0 |
| 0.127350308101681 | 0 | 0 | 0 |
| 0.128824955169329 | 0 | 0 | 0 |
| 0.130316677845246 | 0 | 0 | 0 |
| 0.131825673855657 | 0 | 0 | 0 |
| 0.133352143216348 | 0 | 0 | 0 |
| 0.134896288259182 | 0 | 0 | 0 |
| 0.136458313658909 | 0 | 0 | 0 |
| 0.138038426460305 | 0 | 0 | 0 |
| 0.139636836105611 | 0 | 0 | 0 |
| 0.141253754462292 | 0 | 0 | 0 |
| 0.142889395851128 | 0 | 0 | 0 |
| 0.14454397707461 | 0 | 0 | 0 |
| 0.146217717445689 | 0 | 0 | 0 |
| 0.147910838816839 | 0 | 0 | 0 |
| 0.149623565609461 | 0 | 0 | 0 |
| 0.151356124843639 | 0 | 0 | 0 |
| 0.153108746168222 | 0 | 0 | 0 |
| 0.154881661891267 | 0 | 0 | 0 |
| 0.156675107010834 | 0 | 0 | 0 |
| 0.158489319246131 | 0 | 0 | 0 |
| 0.160324539069024 | 0 | 0 | 0 |
| 0.162181009735913 | 0 | 0 | 0 |
| 0.164058977319974 | 0 | 0 | 0 |
| 0.165958690743776 | 0 | 0 | 0 |
| 0.167880401812276 | 0 | 0 | 0 |
| 0.169824365246195 | 0 | 0 | 0 |
| 0.17179083871578 | 0 | 0 | 0 |
| 0.173780082874959 | 0 | 0 | 0 |
| 0.175792361395891 | 0 | 0 | 0 |
| 0.177827941003914 | 0 | 0 | 0 |
| 0.179887091512901 | 0 | 0 | 0 |
| 0.181970085861021 | 0 | 0 | 0 |
| 0.184077200146918 | 0 | 0 | 0 |
| 0.186208713666309 | 0 | 0 | 0 |
| 0.188364908949003 | 0 | 0 | 0 |
| 0.190546071796348 | 0 | 0 | 0 |
| 0.192752491319117 | 0 | 0 | 0 |
| 0.194984459975828 | 0 | 0 | 0 |
| 0.19724227361151 | 0 | 0 | 0 |
| 0.199526231496912 | 0 | 0 | 0 |
| 0.201836636368181 | 0 | 0 | 0 |
| 0.204173794466978 | 0 | 0 | 0 |
| 0.206538015581078 | 0 | 0 | 0 |
| 0.20892961308543 | 0 | 0 | 0 |
| 0.211348903983691 | 0 | 0 | 0 |
| 0.213796208950249 | 0 | 0 | 0 |
| 0.216271852372729 | 0 | 0 | 0 |
| 0.218776162394982 | 0 | 0 | 0 |
| 0.221309470960591 | 0 | 0 | 0 |
| 0.223872113856862 | 0 | 0 | 0 |
| 0.226464430759334 | 0 | 0 | 0 |
| 0.229086765276806 | 0 | 0 | 0 |
| 0.231739464996876 | 0 | 0 | 0 |
| 0.234422881532021 | 0 | 0 | 0 |
| 0.237137370566195 | 0 | 0 | 0 |
| 0.239883291901979 | 0 | 0 | 0 |
| 0.242661009508272 | 0 | 0 | 0 |
| 0.245470891568533 | 0 | 0 | 0 |
| 0.248313310529588 | 0 | 0 | 0 |
| 0.251188643150989 | 0 | 0 | 0 |
| 0.254097270554962 | 0 | 0 | 0 |
| 0.257039578276918 | 0 | 0 | 0 |
| 0.260015956316559 | 0 | 0 | 0 |
| 0.263026799189571 | 0 | 0 | 0 |
| 0.266072505979914 | 0 | 0 | 0 |
| 0.269153480392725 | 0 | 0 | 0 |
| 0.272270130807825 | 0 | 0 | 0 |
| 0.275422870333851 | 0 | 0 | 0 |
| 0.278612116863012 | 0 | 0 | 0 |
| 0.28183829312648 | 0 | 0 | 0 |
| 0.285101826750426 | 0 | 0 | 0 |
| 0.288403150312697 | 0 | 0 | 0 |
| 0.291742701400153 | 0 | 0 | 0 |
| 0.295120922666675 | 0 | 0 | 0 |
| 0.298538261891833 | 0 | 0 | 0 |
| 0.301995172040239 | 0 | 0 | 0 |
| 0.305492111321589 | 0 | 0 | 0 |
| 0.309029543251398 | 0 | 0 | 0 |
| 0.312607936712435 | 0 | 0 | 0 |
| 0.316227766016877 | 0 | 0 | 0 |
| 0.31988951096918 | 0 | 0 | 0 |
| 0.323593656929669 | 0 | 0 | 0 |
| 0.327340694878879 | 0 | 0 | 0 |
| 0.331131121482633 | 0 | 0 | 0 |
| 0.33496543915787 | 0 | 0 | 0 |
| 0.338844156139245 | 0 | 0 | 0 |
| 0.342767786546493 | 0 | 0 | 0 |
| 0.346736850452575 | 0 | 0 | 0 |
| 0.350751873952612 | 0 | 0 | 0 |
| 0.35481338923362 | 0 | 0 | 0 |
| 0.35892193464505 | 0 | 0 | 0 |
| 0.363078054770147 | 0 | 0 | 0 |
| 0.367282300498131 | 0 | 0 | 0 |
| 0.371535229097219 | 0 | 0 | 0 |
| 0.375837404288492 | 0 | 0 | 0 |
| 0.380189396320609 | 0 | 0 | 0 |
| 0.384591782045402 | 0 | 0 | 0 |
| 0.38904514499433 | 0 | 0 | 0 |
| 0.393550075455827 | 0 | 0 | 0 |
| 0.398107170553548 | 0 | 0 | 0 |
| 0.40271703432551 | 0 | 0 | 0 |
| 0.407380277804164 | 0 | 0 | 0 |
| 0.412097519097382 | 0 | 0 | 0 |
| 0.416869383470388 | 0 | 0 | 0 |
| 0.421696503428636 | 0 | 0 | 0 |
| 0.426579518801647 | 0 | 0 | 0 |
| 0.43151907682782 | 0 | 0 | 0 |
| 0.436515832240221 | 0 | 0 | 0 |
| 0.441570447353369 | 0 | 0 | 0 |
| 0.44668359215102 | 0 | 0 | 0 |
| 0.45185594437498 | 0 | 0 | 0 |
| 0.457088189614933 | 0 | 0 | 0 |
| 0.462381021399319 | 0 | 0 | 0 |
| 0.467735141287258 | 0 | 0 | 0 |
| 0.473151258961541 | 0 | 0 | 0 |
| 0.4786300923227 | 0 | 0 | 0 |
| 0.484172367584161 | 0 | 0 | 0 |
| 0.489778819368509 | 0 | 0 | 0 |
| 0.495450190804854 | 0 | 0 | 0 |
| 0.501187233627337 | 0 | 0 | 0 |
| 0.506990708274769 | 0 | 0 | 0 |
| 0.512861383991431 | 0 | 0 | 0 |
| 0.518800038929028 | 0 | 0 | 0 |
| 0.52480746024984 | 0 | 0 | 0 |
| 0.530884444231057 | 0 | 0 | 0 |
| 0.537031796370322 | 0 | 0 | 0 |
| 0.543250331492503 | 0 | 0 | 0 |
| 0.549540873857695 | 0 | 0 | 0 |
| 0.555904257270475 | 0 | 0 | 0 |
| 0.562341325190422 | 0 | 0 | 0 |
| 0.568852930843915 | 0 | 0 | 0 |
| 0.575439937337231 | 0 | 0 | 0 |
| 0.582103217770947 | 0 | 0 | 0 |
| 0.588843655355665 | 0 | 0 | 0 |
| 0.595662143529087 | 0 | 0 | 0 |
| 0.602559586074436 | 0 | 0 | 0 |
| 0.609536897240248 | 0 | 0 | 0 |
| 0.616595001861562 | 0 | 0 | 0 |
| 0.6237348354825 | 0 | 0 | 0 |
| 0.630957344480275 | 0 | 0 | 0 |
| 0.638263486190631 | 0 | 0 | 0 |
| 0.645654229034739 | 0 | 0 | 0 |
| 0.653130552647557 | 0 | 0 | 0 |
| 0.660693448007681 | 0 | 0 | 0 |
| 0.668343917568701 | 0 | 0 | 0 |
| 0.676082975392069 | 0 | 0 | 0 |
| 0.683911647281518 | 0 | 0 | 0 |
| 0.691830970919026 | 0 | 0 | 0 |
| 0.699841996002364 | 0 | 0 | 0 |
| 0.70794578438423 | 0 | 0 | 0 |
| 0.716143410212995 | 0 | 0 | 0 |
| 0.724435960075084 | 0 | 0 | 0 |
| 0.732824533138999 | 0 | 0 | 0 |
| 0.741310241301014 | 0 | 0 | 0 |
| 0.749894209332553 | 0 | 0 | 0 |
| 0.758577575029283 | 0 | 0 | 0 |
| 0.767361489361919 | 0 | 0 | 0 |
| 0.776247116628793 | 0 | 0 | 0 |
| 0.785235634610174 | 0 | 0 | 0 |
| 0.794328234724385 | 0 | 0 | 0 |
| 0.803526122185722 | 0 | 0 | 0 |
| 0.812830516164205 | 0 | 0 | 0 |
| 0.822242649947179 | 0 | 0 | 0 |
| 0.83176377110278 | 0 | 0 | 0 |
| 0.841395141645305 | 0 | 0 | 0 |
| 0.851138038202488 | 0 | 0 | 0 |
| 0.860993752184714 | 0 | 0 | 0 |
| 0.870963589956195 | 0 | 0 | 0 |
| 0.88104887300813 | 0 | 0 | 0 |
| 0.891250938133863 | 0 | 0 | 0 |
| 0.901571137606075 | 0 | 0 | 0 |
| 0.91201083935603 | 0 | 0 | 0 |
| 0.922571427154884 | 0 | 0 | 0 |
| 0.933254300797114 | 0 | 0 | 0 |
| 0.944060876286047 | 0 | 0 | 0 |
| 0.954992586021562 | 0 | 0 | 0 |
| 0.96605087898994 | 0 | 0 | 0 |
| 0.977237220955939 | 0 | 0 | 0 |
| 0.988553094657069 | 0 | 0 | 0 |
| 1.000000000000132 | 0 | 0 | 0 |